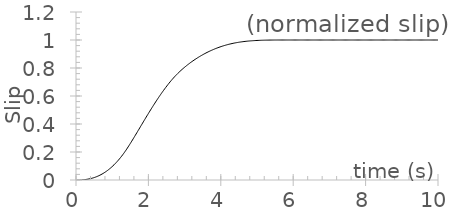
| Category | displacement |
|---|---|
| 0.0 | 0 |
| 0.01 | 0 |
| 0.02 | 0 |
| 0.03 | 0 |
| 0.04 | 0 |
| 0.05 | 0 |
| 0.06 | 0 |
| 0.07 | 0 |
| 0.08 | 0 |
| 0.09 | 0 |
| 0.1 | 0 |
| 0.11 | 0 |
| 0.12 | 0 |
| 0.13 | 0.001 |
| 0.14 | 0.001 |
| 0.15 | 0.001 |
| 0.16 | 0.001 |
| 0.17 | 0.001 |
| 0.18 | 0.001 |
| 0.19 | 0.002 |
| 0.2 | 0.002 |
| 0.21 | 0.002 |
| 0.22 | 0.002 |
| 0.23 | 0.002 |
| 0.24 | 0.003 |
| 0.25 | 0.003 |
| 0.26 | 0.003 |
| 0.27 | 0.004 |
| 0.28 | 0.004 |
| 0.29 | 0.004 |
| 0.3 | 0.005 |
| 0.31 | 0.005 |
| 0.32 | 0.006 |
| 0.33 | 0.006 |
| 0.34 | 0.007 |
| 0.35 | 0.007 |
| 0.36 | 0.008 |
| 0.37 | 0.008 |
| 0.38 | 0.009 |
| 0.39 | 0.009 |
| 0.4 | 0.01 |
| 0.41 | 0.01 |
| 0.42 | 0.011 |
| 0.43 | 0.012 |
| 0.44 | 0.013 |
| 0.45 | 0.013 |
| 0.46 | 0.014 |
| 0.47 | 0.015 |
| 0.48 | 0.016 |
| 0.49 | 0.016 |
| 0.5 | 0.017 |
| 0.51 | 0.018 |
| 0.52 | 0.019 |
| 0.53 | 0.02 |
| 0.54 | 0.021 |
| 0.55 | 0.022 |
| 0.56 | 0.023 |
| 0.57 | 0.024 |
| 0.58 | 0.025 |
| 0.59 | 0.026 |
| 0.6 | 0.027 |
| 0.61 | 0.028 |
| 0.62 | 0.029 |
| 0.63 | 0.031 |
| 0.64 | 0.032 |
| 0.65 | 0.033 |
| 0.66 | 0.034 |
| 0.67 | 0.036 |
| 0.68 | 0.037 |
| 0.69 | 0.038 |
| 0.7 | 0.04 |
| 0.71 | 0.041 |
| 0.72 | 0.043 |
| 0.73 | 0.044 |
| 0.74 | 0.046 |
| 0.75 | 0.047 |
| 0.76 | 0.049 |
| 0.77 | 0.05 |
| 0.78 | 0.052 |
| 0.79 | 0.054 |
| 0.8 | 0.055 |
| 0.81 | 0.057 |
| 0.82 | 0.059 |
| 0.83 | 0.061 |
| 0.84 | 0.062 |
| 0.85 | 0.064 |
| 0.86 | 0.066 |
| 0.87 | 0.068 |
| 0.88 | 0.07 |
| 0.89 | 0.072 |
| 0.9 | 0.074 |
| 0.91 | 0.076 |
| 0.92 | 0.078 |
| 0.93 | 0.08 |
| 0.94 | 0.082 |
| 0.95 | 0.085 |
| 0.96 | 0.087 |
| 0.97 | 0.089 |
| 0.98 | 0.091 |
| 0.99 | 0.094 |
| 1.0 | 0.096 |
| 1.01 | 0.098 |
| 1.02 | 0.101 |
| 1.03 | 0.103 |
| 1.04 | 0.106 |
| 1.05 | 0.108 |
| 1.06 | 0.111 |
| 1.07 | 0.114 |
| 1.08 | 0.116 |
| 1.09 | 0.119 |
| 1.1 | 0.122 |
| 1.11 | 0.124 |
| 1.12 | 0.127 |
| 1.13 | 0.13 |
| 1.14 | 0.133 |
| 1.15 | 0.136 |
| 1.16 | 0.139 |
| 1.17 | 0.142 |
| 1.18 | 0.145 |
| 1.19 | 0.148 |
| 1.2 | 0.151 |
| 1.21 | 0.154 |
| 1.22 | 0.157 |
| 1.23 | 0.16 |
| 1.24 | 0.163 |
| 1.25 | 0.167 |
| 1.26 | 0.17 |
| 1.27 | 0.173 |
| 1.28 | 0.177 |
| 1.29 | 0.18 |
| 1.3 | 0.184 |
| 1.31 | 0.187 |
| 1.32 | 0.191 |
| 1.33 | 0.194 |
| 1.34 | 0.198 |
| 1.35 | 0.202 |
| 1.36 | 0.205 |
| 1.37 | 0.209 |
| 1.38 | 0.213 |
| 1.39 | 0.217 |
| 1.4 | 0.221 |
| 1.41 | 0.224 |
| 1.42 | 0.228 |
| 1.43 | 0.232 |
| 1.44 | 0.236 |
| 1.45 | 0.24 |
| 1.46 | 0.244 |
| 1.47 | 0.248 |
| 1.48 | 0.252 |
| 1.49 | 0.257 |
| 1.5 | 0.261 |
| 1.51 | 0.265 |
| 1.52 | 0.269 |
| 1.53 | 0.273 |
| 1.54 | 0.277 |
| 1.55 | 0.282 |
| 1.56 | 0.286 |
| 1.57 | 0.29 |
| 1.58 | 0.294 |
| 1.59 | 0.299 |
| 1.6 | 0.303 |
| 1.61 | 0.307 |
| 1.62 | 0.311 |
| 1.63 | 0.316 |
| 1.64 | 0.32 |
| 1.65 | 0.324 |
| 1.66 | 0.329 |
| 1.67 | 0.333 |
| 1.68 | 0.337 |
| 1.69 | 0.341 |
| 1.7 | 0.346 |
| 1.71 | 0.35 |
| 1.72 | 0.354 |
| 1.73 | 0.359 |
| 1.74 | 0.363 |
| 1.75 | 0.368 |
| 1.76 | 0.372 |
| 1.77 | 0.376 |
| 1.78 | 0.381 |
| 1.79 | 0.385 |
| 1.8 | 0.389 |
| 1.81 | 0.394 |
| 1.82 | 0.398 |
| 1.83 | 0.402 |
| 1.84 | 0.407 |
| 1.85 | 0.411 |
| 1.86 | 0.415 |
| 1.87 | 0.42 |
| 1.88 | 0.424 |
| 1.89 | 0.428 |
| 1.9 | 0.432 |
| 1.91 | 0.437 |
| 1.92 | 0.441 |
| 1.93 | 0.445 |
| 1.94 | 0.45 |
| 1.95 | 0.454 |
| 1.96 | 0.458 |
| 1.97 | 0.462 |
| 1.98 | 0.467 |
| 1.99 | 0.471 |
| 2.0 | 0.475 |
| 2.01 | 0.479 |
| 2.02 | 0.484 |
| 2.03 | 0.488 |
| 2.04 | 0.492 |
| 2.05 | 0.496 |
| 2.06 | 0.5 |
| 2.07 | 0.505 |
| 2.08 | 0.509 |
| 2.09 | 0.513 |
| 2.1 | 0.517 |
| 2.11 | 0.521 |
| 2.12 | 0.525 |
| 2.13 | 0.529 |
| 2.14 | 0.533 |
| 2.15 | 0.537 |
| 2.16 | 0.541 |
| 2.17 | 0.545 |
| 2.18 | 0.549 |
| 2.19 | 0.553 |
| 2.2 | 0.557 |
| 2.21 | 0.561 |
| 2.22 | 0.565 |
| 2.23 | 0.569 |
| 2.24 | 0.573 |
| 2.25 | 0.577 |
| 2.26 | 0.581 |
| 2.27 | 0.585 |
| 2.28 | 0.589 |
| 2.29 | 0.593 |
| 2.3 | 0.596 |
| 2.31 | 0.6 |
| 2.32 | 0.604 |
| 2.33 | 0.608 |
| 2.34 | 0.611 |
| 2.35 | 0.615 |
| 2.36 | 0.619 |
| 2.37 | 0.622 |
| 2.38 | 0.626 |
| 2.39 | 0.63 |
| 2.4 | 0.633 |
| 2.41 | 0.637 |
| 2.42 | 0.641 |
| 2.43 | 0.644 |
| 2.44 | 0.648 |
| 2.45 | 0.651 |
| 2.46 | 0.655 |
| 2.47 | 0.658 |
| 2.48 | 0.662 |
| 2.49 | 0.665 |
| 2.5 | 0.668 |
| 2.51 | 0.672 |
| 2.52 | 0.675 |
| 2.53 | 0.678 |
| 2.54 | 0.682 |
| 2.55 | 0.685 |
| 2.56 | 0.688 |
| 2.57 | 0.691 |
| 2.58 | 0.695 |
| 2.59 | 0.698 |
| 2.6 | 0.701 |
| 2.61 | 0.704 |
| 2.62 | 0.707 |
| 2.63 | 0.71 |
| 2.64 | 0.713 |
| 2.65 | 0.716 |
| 2.66 | 0.719 |
| 2.67 | 0.722 |
| 2.68 | 0.725 |
| 2.69 | 0.728 |
| 2.7 | 0.731 |
| 2.71 | 0.734 |
| 2.72 | 0.737 |
| 2.73 | 0.739 |
| 2.74 | 0.742 |
| 2.75 | 0.745 |
| 2.76 | 0.748 |
| 2.77 | 0.75 |
| 2.78 | 0.753 |
| 2.79 | 0.756 |
| 2.8 | 0.758 |
| 2.81 | 0.761 |
| 2.82 | 0.763 |
| 2.83 | 0.766 |
| 2.84 | 0.768 |
| 2.85 | 0.771 |
| 2.86 | 0.773 |
| 2.87 | 0.776 |
| 2.88 | 0.778 |
| 2.89 | 0.78 |
| 2.9 | 0.783 |
| 2.91 | 0.785 |
| 2.92 | 0.787 |
| 2.93 | 0.79 |
| 2.94 | 0.792 |
| 2.95 | 0.794 |
| 2.96 | 0.797 |
| 2.97 | 0.799 |
| 2.98 | 0.801 |
| 2.99 | 0.803 |
| 3.0 | 0.805 |
| 3.01 | 0.807 |
| 3.02 | 0.81 |
| 3.03 | 0.812 |
| 3.04 | 0.814 |
| 3.05 | 0.816 |
| 3.06 | 0.818 |
| 3.07 | 0.82 |
| 3.08 | 0.822 |
| 3.09 | 0.824 |
| 3.1 | 0.826 |
| 3.11 | 0.828 |
| 3.12 | 0.83 |
| 3.13 | 0.832 |
| 3.14 | 0.834 |
| 3.15 | 0.836 |
| 3.16 | 0.838 |
| 3.17 | 0.84 |
| 3.18 | 0.842 |
| 3.19 | 0.843 |
| 3.2 | 0.845 |
| 3.21 | 0.847 |
| 3.22 | 0.849 |
| 3.23 | 0.851 |
| 3.24 | 0.853 |
| 3.25 | 0.854 |
| 3.26 | 0.856 |
| 3.27 | 0.858 |
| 3.28 | 0.86 |
| 3.29 | 0.861 |
| 3.3 | 0.863 |
| 3.31 | 0.865 |
| 3.32 | 0.867 |
| 3.33 | 0.868 |
| 3.34 | 0.87 |
| 3.35 | 0.871 |
| 3.36 | 0.873 |
| 3.37 | 0.875 |
| 3.38 | 0.876 |
| 3.39 | 0.878 |
| 3.4 | 0.88 |
| 3.41 | 0.881 |
| 3.42 | 0.883 |
| 3.43 | 0.884 |
| 3.44 | 0.886 |
| 3.45 | 0.887 |
| 3.46 | 0.889 |
| 3.47 | 0.89 |
| 3.48 | 0.892 |
| 3.49 | 0.893 |
| 3.5 | 0.895 |
| 3.51 | 0.896 |
| 3.52 | 0.898 |
| 3.53 | 0.899 |
| 3.54 | 0.9 |
| 3.55 | 0.902 |
| 3.56 | 0.903 |
| 3.57 | 0.904 |
| 3.58 | 0.906 |
| 3.59 | 0.907 |
| 3.6 | 0.908 |
| 3.61 | 0.91 |
| 3.62 | 0.911 |
| 3.63 | 0.912 |
| 3.64 | 0.914 |
| 3.65 | 0.915 |
| 3.66 | 0.916 |
| 3.67 | 0.917 |
| 3.68 | 0.919 |
| 3.69 | 0.92 |
| 3.7 | 0.921 |
| 3.71 | 0.922 |
| 3.72 | 0.924 |
| 3.73 | 0.925 |
| 3.74 | 0.926 |
| 3.75 | 0.927 |
| 3.76 | 0.928 |
| 3.77 | 0.929 |
| 3.78 | 0.93 |
| 3.79 | 0.932 |
| 3.8 | 0.933 |
| 3.81 | 0.934 |
| 3.82 | 0.935 |
| 3.83 | 0.936 |
| 3.84 | 0.937 |
| 3.85 | 0.938 |
| 3.86 | 0.939 |
| 3.87 | 0.94 |
| 3.88 | 0.941 |
| 3.89 | 0.942 |
| 3.9 | 0.943 |
| 3.91 | 0.944 |
| 3.92 | 0.945 |
| 3.93 | 0.946 |
| 3.94 | 0.947 |
| 3.95 | 0.948 |
| 3.96 | 0.949 |
| 3.97 | 0.95 |
| 3.98 | 0.951 |
| 3.99 | 0.951 |
| 4.0 | 0.952 |
| 4.01 | 0.953 |
| 4.02 | 0.954 |
| 4.03 | 0.955 |
| 4.04 | 0.956 |
| 4.05 | 0.957 |
| 4.06 | 0.957 |
| 4.07 | 0.958 |
| 4.08 | 0.959 |
| 4.09 | 0.96 |
| 4.1 | 0.961 |
| 4.11 | 0.961 |
| 4.12 | 0.962 |
| 4.13 | 0.963 |
| 4.14 | 0.964 |
| 4.15 | 0.964 |
| 4.16 | 0.965 |
| 4.17 | 0.966 |
| 4.18 | 0.966 |
| 4.19 | 0.967 |
| 4.2 | 0.968 |
| 4.21 | 0.968 |
| 4.22 | 0.969 |
| 4.23 | 0.97 |
| 4.24 | 0.97 |
| 4.25 | 0.971 |
| 4.26 | 0.972 |
| 4.27 | 0.972 |
| 4.28 | 0.973 |
| 4.29 | 0.973 |
| 4.3 | 0.974 |
| 4.31 | 0.975 |
| 4.32 | 0.975 |
| 4.33 | 0.976 |
| 4.34 | 0.976 |
| 4.35 | 0.977 |
| 4.36 | 0.977 |
| 4.37 | 0.978 |
| 4.38 | 0.978 |
| 4.39 | 0.979 |
| 4.4 | 0.979 |
| 4.41 | 0.98 |
| 4.42 | 0.98 |
| 4.43 | 0.981 |
| 4.44 | 0.981 |
| 4.45 | 0.982 |
| 4.46 | 0.982 |
| 4.47 | 0.983 |
| 4.48 | 0.983 |
| 4.49 | 0.984 |
| 4.5 | 0.984 |
| 4.51 | 0.984 |
| 4.52 | 0.985 |
| 4.53 | 0.985 |
| 4.54 | 0.986 |
| 4.55 | 0.986 |
| 4.56 | 0.986 |
| 4.57 | 0.987 |
| 4.58 | 0.987 |
| 4.59 | 0.987 |
| 4.6 | 0.988 |
| 4.61 | 0.988 |
| 4.62 | 0.988 |
| 4.63 | 0.989 |
| 4.64 | 0.989 |
| 4.65 | 0.989 |
| 4.66 | 0.99 |
| 4.67 | 0.99 |
| 4.68 | 0.99 |
| 4.69 | 0.99 |
| 4.7 | 0.991 |
| 4.71 | 0.991 |
| 4.72 | 0.991 |
| 4.73 | 0.992 |
| 4.74 | 0.992 |
| 4.75 | 0.992 |
| 4.76 | 0.992 |
| 4.77 | 0.993 |
| 4.78 | 0.993 |
| 4.79 | 0.993 |
| 4.8 | 0.993 |
| 4.81 | 0.993 |
| 4.82 | 0.994 |
| 4.83 | 0.994 |
| 4.84 | 0.994 |
| 4.85 | 0.994 |
| 4.86 | 0.994 |
| 4.87 | 0.995 |
| 4.88 | 0.995 |
| 4.89 | 0.995 |
| 4.9 | 0.995 |
| 4.91 | 0.995 |
| 4.92 | 0.996 |
| 4.93 | 0.996 |
| 4.94 | 0.996 |
| 4.95 | 0.996 |
| 4.96 | 0.996 |
| 4.97 | 0.996 |
| 4.98 | 0.996 |
| 4.99 | 0.997 |
| 5.0 | 0.997 |
| 5.01 | 0.997 |
| 5.02 | 0.997 |
| 5.03 | 0.997 |
| 5.04 | 0.997 |
| 5.05 | 0.997 |
| 5.06 | 0.997 |
| 5.07 | 0.998 |
| 5.08 | 0.998 |
| 5.09 | 0.998 |
| 5.1 | 0.998 |
| 5.11 | 0.998 |
| 5.12 | 0.998 |
| 5.13 | 0.998 |
| 5.14 | 0.998 |
| 5.15 | 0.998 |
| 5.16 | 0.998 |
| 5.17 | 0.998 |
| 5.18 | 0.999 |
| 5.19 | 0.999 |
| 5.2 | 0.999 |
| 5.21 | 0.999 |
| 5.22 | 0.999 |
| 5.23 | 0.999 |
| 5.24 | 0.999 |
| 5.25 | 0.999 |
| 5.26 | 0.999 |
| 5.27 | 0.999 |
| 5.28 | 0.999 |
| 5.29 | 0.999 |
| 5.3 | 0.999 |
| 5.31 | 0.999 |
| 5.32 | 0.999 |
| 5.33 | 0.999 |
| 5.34 | 0.999 |
| 5.35 | 0.999 |
| 5.36 | 0.999 |
| 5.37 | 0.999 |
| 5.38 | 1 |
| 5.39 | 1 |
| 5.4 | 1 |
| 5.41 | 1 |
| 5.42 | 1 |
| 5.43 | 1 |
| 5.44 | 1 |
| 5.45 | 1 |
| 5.46 | 1 |
| 5.47 | 1 |
| 5.48 | 1 |
| 5.49 | 1 |
| 5.5 | 1 |
| 5.51 | 1 |
| 5.52 | 1 |
| 5.53 | 1 |
| 5.54 | 1 |
| 5.55 | 1 |
| 5.56 | 1 |
| 5.57 | 1 |
| 5.58 | 1 |
| 5.59 | 1 |
| 5.6 | 1 |
| 5.61 | 1 |
| 5.62 | 1 |
| 5.63 | 1 |
| 5.64 | 1 |
| 5.65 | 1 |
| 5.66 | 1 |
| 5.67 | 1 |
| 5.68 | 1 |
| 5.69 | 1 |
| 5.7 | 1 |
| 5.71 | 1 |
| 5.72 | 1 |
| 5.73 | 1 |
| 5.74 | 1 |
| 5.75 | 1 |
| 5.76 | 1 |
| 5.77 | 1 |
| 5.78 | 1 |
| 5.79 | 1 |
| 5.8 | 1 |
| 5.81 | 1 |
| 5.82 | 1 |
| 5.83 | 1 |
| 5.84 | 1 |
| 5.85 | 1 |
| 5.86 | 1 |
| 5.87 | 1 |
| 5.88 | 1 |
| 5.89 | 1 |
| 5.9 | 1 |
| 5.91 | 1 |
| 5.92 | 1 |
| 5.93 | 1 |
| 5.94 | 1 |
| 5.95 | 1 |
| 5.96 | 1 |
| 5.97 | 1 |
| 5.98 | 1 |
| 5.99 | 1 |
| 6.0 | 1 |
| 6.01 | 1 |
| 6.02 | 1 |
| 6.03 | 1 |
| 6.04 | 1 |
| 6.05 | 1 |
| 6.06 | 1 |
| 6.07 | 1 |
| 6.08 | 1 |
| 6.09 | 1 |
| 6.1 | 1 |
| 6.11 | 1 |
| 6.12 | 1 |
| 6.13 | 1 |
| 6.14 | 1 |
| 6.15 | 1 |
| 6.16 | 1 |
| 6.17 | 1 |
| 6.18 | 1 |
| 6.19 | 1 |
| 6.2 | 1 |
| 6.21 | 1 |
| 6.22 | 1 |
| 6.23 | 1 |
| 6.24 | 1 |
| 6.25 | 1 |
| 6.26 | 1 |
| 6.27 | 1 |
| 6.28 | 1 |
| 6.29 | 1 |
| 6.3 | 1 |
| 6.31 | 1 |
| 6.32 | 1 |
| 6.33 | 1 |
| 6.34 | 1 |
| 6.35 | 1 |
| 6.36 | 1 |
| 6.37 | 1 |
| 6.38 | 1 |
| 6.39 | 1 |
| 6.4 | 1 |
| 6.41 | 1 |
| 6.42 | 1 |
| 6.43 | 1 |
| 6.44 | 1 |
| 6.45 | 1 |
| 6.46 | 1 |
| 6.47 | 1 |
| 6.48 | 1 |
| 6.49 | 1 |
| 6.5 | 1 |
| 6.51 | 1 |
| 6.52 | 1 |
| 6.53 | 1 |
| 6.54 | 1 |
| 6.55 | 1 |
| 6.56 | 1 |
| 6.57 | 1 |
| 6.58 | 1 |
| 6.59 | 1 |
| 6.6 | 1 |
| 6.61 | 1 |
| 6.62 | 1 |
| 6.63 | 1 |
| 6.64 | 1 |
| 6.65 | 1 |
| 6.66 | 1 |
| 6.67 | 1 |
| 6.68 | 1 |
| 6.69 | 1 |
| 6.7 | 1 |
| 6.71 | 1 |
| 6.72 | 1 |
| 6.73 | 1 |
| 6.74 | 1 |
| 6.75 | 1 |
| 6.76 | 1 |
| 6.77 | 1 |
| 6.78 | 1 |
| 6.79 | 1 |
| 6.8 | 1 |
| 6.81 | 1 |
| 6.82 | 1 |
| 6.83 | 1 |
| 6.84 | 1 |
| 6.85 | 1 |
| 6.86 | 1 |
| 6.87 | 1 |
| 6.88 | 1 |
| 6.89 | 1 |
| 6.9 | 1 |
| 6.91 | 1 |
| 6.92 | 1 |
| 6.93 | 1 |
| 6.94 | 1 |
| 6.95 | 1 |
| 6.96 | 1 |
| 6.97 | 1 |
| 6.98 | 1 |
| 6.99 | 1 |
| 7.0 | 1 |
| 7.01 | 1 |
| 7.02 | 1 |
| 7.03 | 1 |
| 7.04 | 1 |
| 7.05 | 1 |
| 7.06 | 1 |
| 7.07 | 1 |
| 7.08 | 1 |
| 7.09 | 1 |
| 7.1 | 1 |
| 7.11 | 1 |
| 7.12 | 1 |
| 7.13 | 1 |
| 7.14 | 1 |
| 7.15 | 1 |
| 7.16 | 1 |
| 7.17 | 1 |
| 7.18 | 1 |
| 7.19 | 1 |
| 7.2 | 1 |
| 7.21 | 1 |
| 7.22 | 1 |
| 7.23 | 1 |
| 7.24 | 1 |
| 7.25 | 1 |
| 7.26 | 1 |
| 7.27 | 1 |
| 7.28 | 1 |
| 7.29 | 1 |
| 7.3 | 1 |
| 7.31 | 1 |
| 7.32 | 1 |
| 7.33 | 1 |
| 7.34 | 1 |
| 7.35 | 1 |
| 7.36 | 1 |
| 7.37 | 1 |
| 7.38 | 1 |
| 7.39 | 1 |
| 7.4 | 1 |
| 7.41 | 1 |
| 7.42 | 1 |
| 7.43 | 1 |
| 7.44 | 1 |
| 7.45 | 1 |
| 7.46 | 1 |
| 7.47 | 1 |
| 7.48 | 1 |
| 7.49 | 1 |
| 7.5 | 1 |
| 7.51 | 1 |
| 7.52 | 1 |
| 7.53 | 1 |
| 7.54 | 1 |
| 7.55 | 1 |
| 7.56 | 1 |
| 7.57 | 1 |
| 7.58 | 1 |
| 7.59 | 1 |
| 7.6 | 1 |
| 7.61 | 1 |
| 7.62 | 1 |
| 7.63 | 1 |
| 7.64 | 1 |
| 7.65 | 1 |
| 7.66 | 1 |
| 7.67 | 1 |
| 7.68 | 1 |
| 7.69 | 1 |
| 7.7 | 1 |
| 7.71 | 1 |
| 7.72 | 1 |
| 7.73 | 1 |
| 7.74 | 1 |
| 7.75 | 1 |
| 7.76 | 1 |
| 7.77 | 1 |
| 7.78 | 1 |
| 7.79 | 1 |
| 7.8 | 1 |
| 7.81 | 1 |
| 7.82 | 1 |
| 7.83 | 1 |
| 7.84 | 1 |
| 7.85 | 1 |
| 7.86 | 1 |
| 7.87 | 1 |
| 7.88 | 1 |
| 7.89 | 1 |
| 7.9 | 1 |
| 7.91 | 1 |
| 7.92 | 1 |
| 7.93 | 1 |
| 7.94 | 1 |
| 7.95 | 1 |
| 7.96 | 1 |
| 7.97 | 1 |
| 7.98 | 1 |
| 7.99 | 1 |
| 8.0 | 1 |
| 8.01 | 1 |
| 8.02 | 1 |
| 8.03 | 1 |
| 8.04 | 1 |
| 8.05 | 1 |
| 8.06 | 1 |
| 8.07 | 1 |
| 8.08 | 1 |
| 8.09 | 1 |
| 8.1 | 1 |
| 8.11 | 1 |
| 8.12 | 1 |
| 8.13 | 1 |
| 8.14 | 1 |
| 8.15 | 1 |
| 8.16 | 1 |
| 8.17 | 1 |
| 8.18 | 1 |
| 8.19 | 1 |
| 8.2 | 1 |
| 8.21 | 1 |
| 8.22 | 1 |
| 8.23 | 1 |
| 8.24 | 1 |
| 8.25 | 1 |
| 8.26 | 1 |
| 8.27 | 1 |
| 8.28 | 1 |
| 8.29 | 1 |
| 8.3 | 1 |
| 8.31 | 1 |
| 8.32 | 1 |
| 8.33 | 1 |
| 8.34 | 1 |
| 8.35 | 1 |
| 8.36 | 1 |
| 8.37 | 1 |
| 8.38 | 1 |
| 8.39 | 1 |
| 8.4 | 1 |
| 8.41 | 1 |
| 8.42 | 1 |
| 8.43 | 1 |
| 8.44 | 1 |
| 8.45 | 1 |
| 8.46 | 1 |
| 8.47 | 1 |
| 8.48 | 1 |
| 8.49 | 1 |
| 8.5 | 1 |
| 8.51 | 1 |
| 8.52 | 1 |
| 8.53 | 1 |
| 8.54 | 1 |
| 8.55 | 1 |
| 8.56 | 1 |
| 8.57 | 1 |
| 8.58 | 1 |
| 8.59 | 1 |
| 8.6 | 1 |
| 8.61 | 1 |
| 8.62 | 1 |
| 8.63 | 1 |
| 8.64 | 1 |
| 8.65 | 1 |
| 8.66 | 1 |
| 8.67 | 1 |
| 8.68 | 1 |
| 8.69 | 1 |
| 8.7 | 1 |
| 8.71 | 1 |
| 8.72 | 1 |
| 8.73 | 1 |
| 8.74 | 1 |
| 8.75 | 1 |
| 8.76 | 1 |
| 8.77 | 1 |
| 8.78 | 1 |
| 8.79 | 1 |
| 8.8 | 1 |
| 8.81 | 1 |
| 8.82 | 1 |
| 8.83 | 1 |
| 8.84 | 1 |
| 8.85 | 1 |
| 8.86 | 1 |
| 8.87 | 1 |
| 8.88 | 1 |
| 8.89 | 1 |
| 8.9 | 1 |
| 8.91 | 1 |
| 8.92 | 1 |
| 8.93 | 1 |
| 8.94 | 1 |
| 8.95 | 1 |
| 8.96 | 1 |
| 8.97 | 1 |
| 8.98 | 1 |
| 8.99 | 1 |
| 9.0 | 1 |
| 9.01 | 1 |
| 9.02 | 1 |
| 9.03 | 1 |
| 9.04 | 1 |
| 9.05 | 1 |
| 9.06 | 1 |
| 9.07 | 1 |
| 9.08 | 1 |
| 9.09 | 1 |
| 9.1 | 1 |
| 9.11 | 1 |
| 9.12 | 1 |
| 9.13 | 1 |
| 9.14 | 1 |
| 9.15 | 1 |
| 9.16 | 1 |
| 9.17 | 1 |
| 9.18 | 1 |
| 9.19 | 1 |
| 9.2 | 1 |
| 9.21 | 1 |
| 9.22 | 1 |
| 9.23 | 1 |
| 9.24 | 1 |
| 9.25 | 1 |
| 9.26 | 1 |
| 9.27 | 1 |
| 9.28 | 1 |
| 9.29 | 1 |
| 9.3 | 1 |
| 9.31 | 1 |
| 9.32 | 1 |
| 9.33 | 1 |
| 9.34 | 1 |
| 9.35 | 1 |
| 9.36 | 1 |
| 9.37 | 1 |
| 9.38 | 1 |
| 9.39 | 1 |
| 9.4 | 1 |
| 9.41 | 1 |
| 9.42 | 1 |
| 9.43 | 1 |
| 9.44 | 1 |
| 9.45 | 1 |
| 9.46 | 1 |
| 9.47 | 1 |
| 9.48 | 1 |
| 9.49 | 1 |
| 9.5 | 1 |
| 9.51 | 1 |
| 9.52 | 1 |
| 9.53 | 1 |
| 9.54 | 1 |
| 9.55 | 1 |
| 9.56 | 1 |
| 9.57 | 1 |
| 9.58 | 1 |
| 9.59 | 1 |
| 9.6 | 1 |
| 9.61 | 1 |
| 9.62 | 1 |
| 9.63 | 1 |
| 9.64 | 1 |
| 9.65 | 1 |
| 9.66 | 1 |
| 9.67 | 1 |
| 9.68 | 1 |
| 9.69 | 1 |
| 9.7 | 1 |
| 9.71 | 1 |
| 9.72 | 1 |
| 9.73 | 1 |
| 9.74 | 1 |
| 9.75 | 1 |
| 9.76 | 1 |
| 9.77 | 1 |
| 9.78 | 1 |
| 9.79 | 1 |
| 9.8 | 1 |
| 9.81 | 1 |
| 9.82 | 1 |
| 9.83 | 1 |
| 9.84 | 1 |
| 9.85 | 1 |
| 9.86 | 1 |
| 9.87 | 1 |
| 9.88 | 1 |
| 9.89 | 1 |
| 9.9 | 1 |
| 9.91 | 1 |
| 9.92 | 1 |
| 9.93 | 1 |
| 9.94 | 1 |
| 9.95 | 1 |
| 9.96 | 1 |
| 9.97 | 1 |
| 9.98 | 1 |
| 9.99 | 1 |
| 10.0 | 1 |
| 10.01 | 1 |
| 10.02 | 1 |
| 10.03 | 1 |
| 10.04 | 1 |
| 10.05 | 1 |
| 10.06 | 1 |
| 10.07 | 1 |
| 10.08 | 1 |
| 10.09 | 1 |
| 10.1 | 1 |
| 10.11 | 1 |
| 10.12 | 1 |
| 10.13 | 1 |
| 10.14 | 1 |
| 10.15 | 1 |
| 10.16 | 1 |
| 10.17 | 1 |
| 10.18 | 1 |
| 10.19 | 1 |
| 10.2 | 1 |
| 10.21 | 1 |
| 10.22 | 1 |
| 10.23 | 1 |
| 10.24 | 1 |
| 10.25 | 1 |
| 10.26 | 1 |
| 10.27 | 1 |
| 10.28 | 1 |
| 10.29 | 1 |
| 10.3 | 1 |
| 10.31 | 1 |
| 10.32 | 1 |
| 10.33 | 1 |
| 10.34 | 1 |
| 10.35 | 1 |
| 10.36 | 1 |
| 10.37 | 1 |
| 10.38 | 1 |
| 10.39 | 1 |
| 10.4 | 1 |
| 10.41 | 1 |
| 10.42 | 1 |
| 10.43 | 1 |
| 10.44 | 1 |
| 10.45 | 1 |
| 10.46 | 1 |
| 10.47 | 1 |
| 10.48 | 1 |
| 10.49 | 1 |
| 10.5 | 1 |
| 10.51 | 1 |
| 10.52 | 1 |
| 10.53 | 1 |
| 10.54 | 1 |
| 10.55 | 1 |
| 10.56 | 1 |
| 10.57 | 1 |
| 10.58 | 1 |
| 10.59 | 1 |
| 10.6 | 1 |
| 10.61 | 1 |
| 10.62 | 1 |
| 10.63 | 1 |
| 10.64 | 1 |
| 10.65 | 1 |
| 10.66 | 1 |
| 10.67 | 1 |
| 10.68 | 1 |
| 10.69 | 1 |
| 10.7 | 1 |
| 10.71 | 1 |
| 10.72 | 1 |
| 10.73 | 1 |
| 10.74 | 1 |
| 10.75 | 1 |
| 10.76 | 1 |
| 10.77 | 1 |
| 10.78 | 1 |
| 10.79 | 1 |
| 10.8 | 1 |
| 10.81 | 1 |
| 10.82 | 1 |
| 10.83 | 1 |
| 10.84 | 1 |
| 10.85 | 1 |
| 10.86 | 1 |
| 10.87 | 1 |
| 10.88 | 1 |
| 10.89 | 1 |
| 10.9 | 1 |
| 10.91 | 1 |
| 10.92 | 1 |
| 10.93 | 1 |
| 10.94 | 1 |
| 10.95 | 1 |
| 10.96 | 1 |
| 10.97 | 1 |
| 10.98 | 1 |
| 10.99 | 1 |
| 11.0 | 1 |
| 11.01 | 1 |
| 11.02 | 1 |
| 11.03 | 1 |
| 11.04 | 1 |
| 11.05 | 1 |
| 11.06 | 1 |
| 11.07 | 1 |
| 11.08 | 1 |
| 11.09 | 1 |
| 11.1 | 1 |
| 11.11 | 1 |
| 11.12 | 1 |
| 11.13 | 1 |
| 11.14 | 1 |
| 11.15 | 1 |
| 11.16 | 1 |
| 11.17 | 1 |
| 11.18 | 1 |
| 11.19 | 1 |
| 11.2 | 1 |
| 11.21 | 1 |
| 11.22 | 1 |
| 11.23 | 1 |
| 11.24 | 1 |
| 11.25 | 1 |
| 11.26 | 1 |
| 11.27 | 1 |
| 11.28 | 1 |
| 11.29 | 1 |
| 11.3 | 1 |
| 11.31 | 1 |
| 11.32 | 1 |
| 11.33 | 1 |
| 11.34 | 1 |
| 11.35 | 1 |
| 11.36 | 1 |
| 11.37 | 1 |
| 11.38 | 1 |
| 11.39 | 1 |
| 11.4 | 1 |
| 11.41 | 1 |
| 11.42 | 1 |
| 11.43 | 1 |
| 11.44 | 1 |
| 11.45 | 1 |
| 11.46 | 1 |
| 11.47 | 1 |
| 11.48 | 1 |
| 11.49 | 1 |
| 11.5 | 1 |
| 11.51 | 1 |
| 11.52 | 1 |
| 11.53 | 1 |
| 11.54 | 1 |
| 11.55 | 1 |
| 11.56 | 1 |
| 11.57 | 1 |
| 11.58 | 1 |
| 11.59 | 1 |
| 11.6 | 1 |
| 11.61 | 1 |
| 11.62 | 1 |
| 11.63 | 1 |
| 11.64 | 1 |
| 11.65 | 1 |
| 11.66 | 1 |
| 11.67 | 1 |
| 11.68 | 1 |
| 11.69 | 1 |
| 11.7 | 1 |
| 11.71 | 1 |
| 11.72 | 1 |
| 11.73 | 1 |
| 11.74 | 1 |
| 11.75 | 1 |
| 11.76 | 1 |
| 11.77 | 1 |
| 11.78 | 1 |
| 11.79 | 1 |
| 11.8 | 1 |
| 11.81 | 1 |
| 11.82 | 1 |
| 11.83 | 1 |
| 11.84 | 1 |
| 11.85 | 1 |
| 11.86 | 1 |
| 11.87 | 1 |
| 11.88 | 1 |
| 11.89 | 1 |
| 11.9 | 1 |
| 11.91 | 1 |
| 11.92 | 1 |
| 11.93 | 1 |
| 11.94 | 1 |
| 11.95 | 1 |
| 11.96 | 1 |
| 11.97 | 1 |
| 11.98 | 1 |
| 11.99 | 1 |
| 12.0 | 1 |
| 12.01 | 1 |
| 12.02 | 1 |
| 12.03 | 1 |
| 12.04 | 1 |
| 12.05 | 1 |
| 12.06 | 1 |
| 12.07 | 1 |
| 12.08 | 1 |
| 12.09 | 1 |
| 12.1 | 1 |
| 12.11 | 1 |
| 12.12 | 1 |
| 12.13 | 1 |
| 12.14 | 1 |
| 12.15 | 1 |
| 12.16 | 1 |
| 12.17 | 1 |
| 12.18 | 1 |
| 12.19 | 1 |
| 12.2 | 1 |
| 12.21 | 1 |
| 12.22 | 1 |
| 12.23 | 1 |
| 12.24 | 1 |
| 12.25 | 1 |
| 12.26 | 1 |
| 12.27 | 1 |
| 12.28 | 1 |
| 12.29 | 1 |
| 12.3 | 1 |
| 12.31 | 1 |
| 12.32 | 1 |
| 12.33 | 1 |
| 12.34 | 1 |
| 12.35 | 1 |
| 12.36 | 1 |
| 12.37 | 1 |
| 12.38 | 1 |
| 12.39 | 1 |
| 12.4 | 1 |
| 12.41 | 1 |
| 12.42 | 1 |
| 12.43 | 1 |
| 12.44 | 1 |
| 12.45 | 1 |
| 12.46 | 1 |
| 12.47 | 1 |
| 12.48 | 1 |
| 12.49 | 1 |
| 12.5 | 1 |
| 12.51 | 1 |
| 12.52 | 1 |
| 12.53 | 1 |
| 12.54 | 1 |
| 12.55 | 1 |
| 12.56 | 1 |
| 12.57 | 1 |
| 12.58 | 1 |
| 12.59 | 1 |
| 12.6 | 1 |
| 12.61 | 1 |
| 12.62 | 1 |
| 12.63 | 1 |
| 12.64 | 1 |
| 12.65 | 1 |
| 12.66 | 1 |
| 12.67 | 1 |
| 12.68 | 1 |
| 12.69 | 1 |
| 12.7 | 1 |
| 12.71 | 1 |
| 12.72 | 1 |
| 12.73 | 1 |
| 12.74 | 1 |
| 12.75 | 1 |
| 12.76 | 1 |
| 12.77 | 1 |
| 12.78 | 1 |
| 12.79 | 1 |
| 12.8 | 1 |
| 12.81 | 1 |
| 12.82 | 1 |
| 12.83 | 1 |
| 12.84 | 1 |
| 12.85 | 1 |
| 12.86 | 1 |
| 12.87 | 1 |
| 12.88 | 1 |
| 12.89 | 1 |
| 12.9 | 1 |
| 12.91 | 1 |
| 12.92 | 1 |
| 12.93 | 1 |
| 12.94 | 1 |
| 12.95 | 1 |
| 12.96 | 1 |
| 12.97 | 1 |
| 12.98 | 1 |
| 12.99 | 1 |
| 13.0 | 1 |
| 13.01 | 1 |
| 13.02 | 1 |
| 13.03 | 1 |
| 13.04 | 1 |
| 13.05 | 1 |
| 13.06 | 1 |
| 13.07 | 1 |
| 13.08 | 1 |
| 13.09 | 1 |
| 13.1 | 1 |
| 13.11 | 1 |
| 13.12 | 1 |
| 13.13 | 1 |
| 13.14 | 1 |
| 13.15 | 1 |
| 13.16 | 1 |
| 13.17 | 1 |
| 13.18 | 1 |
| 13.19 | 1 |
| 13.2 | 1 |
| 13.21 | 1 |
| 13.22 | 1 |
| 13.23 | 1 |
| 13.24 | 1 |
| 13.25 | 1 |
| 13.26 | 1 |
| 13.27 | 1 |
| 13.28 | 1 |
| 13.29 | 1 |
| 13.3 | 1 |
| 13.31 | 1 |
| 13.32 | 1 |
| 13.33 | 1 |
| 13.34 | 1 |
| 13.35 | 1 |
| 13.36 | 1 |
| 13.37 | 1 |
| 13.38 | 1 |
| 13.39 | 1 |
| 13.4 | 1 |
| 13.41 | 1 |
| 13.42 | 1 |
| 13.43 | 1 |
| 13.44 | 1 |
| 13.45 | 1 |
| 13.46 | 1 |
| 13.47 | 1 |
| 13.48 | 1 |
| 13.49 | 1 |
| 13.5 | 1 |
| 13.51 | 1 |
| 13.52 | 1 |
| 13.53 | 1 |
| 13.54 | 1 |
| 13.55 | 1 |
| 13.56 | 1 |
| 13.57 | 1 |
| 13.58 | 1 |
| 13.59 | 1 |
| 13.6 | 1 |
| 13.61 | 1 |
| 13.62 | 1 |
| 13.63 | 1 |
| 13.64 | 1 |
| 13.65 | 1 |
| 13.66 | 1 |
| 13.67 | 1 |
| 13.68 | 1 |
| 13.69 | 1 |
| 13.7 | 1 |
| 13.71 | 1 |
| 13.72 | 1 |
| 13.73 | 1 |
| 13.74 | 1 |
| 13.75 | 1 |
| 13.76 | 1 |
| 13.77 | 1 |
| 13.78 | 1 |
| 13.79 | 1 |
| 13.8 | 1 |
| 13.81 | 1 |
| 13.82 | 1 |
| 13.83 | 1 |
| 13.84 | 1 |
| 13.85 | 1 |
| 13.86 | 1 |
| 13.87 | 1 |
| 13.88 | 1 |
| 13.89 | 1 |
| 13.9 | 1 |
| 13.91 | 1 |
| 13.92 | 1 |
| 13.93 | 1 |
| 13.94 | 1 |
| 13.95 | 1 |
| 13.96 | 1 |
| 13.97 | 1 |
| 13.98 | 1 |
| 13.99 | 1 |
| 14.0 | 1 |
| 14.01 | 1 |
| 14.02 | 1 |
| 14.03 | 1 |
| 14.04 | 1 |
| 14.05 | 1 |
| 14.06 | 1 |
| 14.07 | 1 |
| 14.08 | 1 |
| 14.09 | 1 |
| 14.1 | 1 |
| 14.11 | 1 |
| 14.12 | 1 |
| 14.13 | 1 |
| 14.14 | 1 |
| 14.15 | 1 |
| 14.16 | 1 |
| 14.17 | 1 |
| 14.18 | 1 |
| 14.19 | 1 |
| 14.2 | 1 |
| 14.21 | 1 |
| 14.22 | 1 |
| 14.23 | 1 |
| 14.24 | 1 |
| 14.25 | 1 |
| 14.26 | 1 |
| 14.27 | 1 |
| 14.28 | 1 |
| 14.29 | 1 |
| 14.3 | 1 |
| 14.31 | 1 |
| 14.32 | 1 |
| 14.33 | 1 |
| 14.34 | 1 |
| 14.35 | 1 |
| 14.36 | 1 |
| 14.37 | 1 |
| 14.38 | 1 |
| 14.39 | 1 |
| 14.4 | 1 |
| 14.41 | 1 |
| 14.42 | 1 |
| 14.43 | 1 |
| 14.44 | 1 |
| 14.45 | 1 |
| 14.46 | 1 |
| 14.47 | 1 |
| 14.48 | 1 |
| 14.49 | 1 |
| 14.5 | 1 |
| 14.51 | 1 |
| 14.52 | 1 |
| 14.53 | 1 |
| 14.54 | 1 |
| 14.55 | 1 |
| 14.56 | 1 |
| 14.57 | 1 |
| 14.58 | 1 |
| 14.59 | 1 |
| 14.6 | 1 |
| 14.61 | 1 |
| 14.62 | 1 |
| 14.63 | 1 |
| 14.64 | 1 |
| 14.65 | 1 |
| 14.66 | 1 |
| 14.67 | 1 |
| 14.68 | 1 |
| 14.69 | 1 |
| 14.7 | 1 |
| 14.71 | 1 |
| 14.72 | 1 |
| 14.73 | 1 |
| 14.74 | 1 |
| 14.75 | 1 |
| 14.76 | 1 |
| 14.77 | 1 |
| 14.78 | 1 |
| 14.79 | 1 |
| 14.8 | 1 |
| 14.81 | 1 |
| 14.82 | 1 |
| 14.83 | 1 |
| 14.84 | 1 |
| 14.85 | 1 |
| 14.86 | 1 |
| 14.87 | 1 |
| 14.88 | 1 |
| 14.89 | 1 |
| 14.9 | 1 |
| 14.91 | 1 |
| 14.92 | 1 |
| 14.93 | 1 |
| 14.94 | 1 |
| 14.95 | 1 |
| 14.96 | 1 |
| 14.97 | 1 |
| 14.98 | 1 |
| 14.99 | 1 |
| 15.0 | 1 |
| 15.01 | 1 |
| 15.02 | 1 |
| 15.03 | 1 |
| 15.04 | 1 |
| 15.05 | 1 |
| 15.06 | 1 |
| 15.07 | 1 |
| 15.08 | 1 |
| 15.09 | 1 |
| 15.1 | 1 |
| 15.11 | 1 |
| 15.12 | 1 |
| 15.13 | 1 |
| 15.14 | 1 |
| 15.15 | 1 |
| 15.16 | 1 |
| 15.17 | 1 |
| 15.18 | 1 |
| 15.19 | 1 |
| 15.2 | 1 |
| 15.21 | 1 |
| 15.22 | 1 |
| 15.23 | 1 |
| 15.24 | 1 |
| 15.25 | 1 |
| 15.26 | 1 |
| 15.27 | 1 |
| 15.28 | 1 |
| 15.29 | 1 |
| 15.3 | 1 |
| 15.31 | 1 |
| 15.32 | 1 |
| 15.33 | 1 |
| 15.34 | 1 |
| 15.35 | 1 |
| 15.36 | 1 |
| 15.37 | 1 |
| 15.38 | 1 |
| 15.39 | 1 |
| 15.4 | 1 |
| 15.41 | 1 |
| 15.42 | 1 |
| 15.43 | 1 |
| 15.44 | 1 |
| 15.45 | 1 |
| 15.46 | 1 |
| 15.47 | 1 |
| 15.48 | 1 |
| 15.49 | 1 |
| 15.5 | 1 |
| 15.51 | 1 |
| 15.52 | 1 |
| 15.53 | 1 |
| 15.54 | 1 |
| 15.55 | 1 |
| 15.56 | 1 |
| 15.57 | 1 |
| 15.58 | 1 |
| 15.59 | 1 |
| 15.6 | 1 |
| 15.61 | 1 |
| 15.62 | 1 |
| 15.63 | 1 |
| 15.64 | 1 |
| 15.65 | 1 |
| 15.66 | 1 |
| 15.67 | 1 |
| 15.68 | 1 |
| 15.69 | 1 |
| 15.7 | 1 |
| 15.71 | 1 |
| 15.72 | 1 |
| 15.73 | 1 |
| 15.74 | 1 |
| 15.75 | 1 |
| 15.76 | 1 |
| 15.77 | 1 |
| 15.78 | 1 |
| 15.79 | 1 |
| 15.8 | 1 |
| 15.81 | 1 |
| 15.82 | 1 |
| 15.83 | 1 |
| 15.84 | 1 |
| 15.85 | 1 |
| 15.86 | 1 |
| 15.87 | 1 |
| 15.88 | 1 |
| 15.89 | 1 |
| 15.9 | 1 |
| 15.91 | 1 |
| 15.92 | 1 |
| 15.93 | 1 |
| 15.94 | 1 |
| 15.95 | 1 |
| 15.96 | 1 |
| 15.97 | 1 |
| 15.98 | 1 |
| 15.99 | 1 |
| 16.0 | 1 |
| 16.01 | 1 |
| 16.02 | 1 |
| 16.03 | 1 |
| 16.04 | 1 |
| 16.05 | 1 |
| 16.06 | 1 |
| 16.07 | 1 |
| 16.08 | 1 |
| 16.09 | 1 |
| 16.1 | 1 |
| 16.11 | 1 |
| 16.12 | 1 |
| 16.13 | 1 |
| 16.14 | 1 |
| 16.15 | 1 |
| 16.16 | 1 |
| 16.17 | 1 |
| 16.18 | 1 |
| 16.19 | 1 |
| 16.2 | 1 |
| 16.21 | 1 |
| 16.22 | 1 |
| 16.23 | 1 |
| 16.24 | 1 |
| 16.25 | 1 |
| 16.26 | 1 |
| 16.27 | 1 |
| 16.28 | 1 |
| 16.29 | 1 |
| 16.3 | 1 |
| 16.31 | 1 |
| 16.32 | 1 |
| 16.33 | 1 |
| 16.34 | 1 |
| 16.35 | 1 |
| 16.36 | 1 |
| 16.37 | 1 |
| 16.38 | 1 |
| 16.39 | 1 |
| 16.4 | 1 |
| 16.41 | 1 |
| 16.42 | 1 |
| 16.43 | 1 |
| 16.44 | 1 |
| 16.45 | 1 |
| 16.46 | 1 |
| 16.47 | 1 |
| 16.48 | 1 |
| 16.49 | 1 |
| 16.5 | 1 |
| 16.51 | 1 |
| 16.52 | 1 |
| 16.53 | 1 |
| 16.54 | 1 |
| 16.55 | 1 |
| 16.56 | 1 |
| 16.57 | 1 |
| 16.58 | 1 |
| 16.59 | 1 |
| 16.6 | 1 |
| 16.61 | 1 |
| 16.62 | 1 |
| 16.63 | 1 |
| 16.64 | 1 |
| 16.65 | 1 |
| 16.66 | 1 |
| 16.67 | 1 |
| 16.68 | 1 |
| 16.69 | 1 |
| 16.7 | 1 |
| 16.71 | 1 |
| 16.72 | 1 |
| 16.73 | 1 |
| 16.74 | 1 |
| 16.75 | 1 |
| 16.76 | 1 |
| 16.77 | 1 |
| 16.78 | 1 |
| 16.79 | 1 |
| 16.8 | 1 |
| 16.81 | 1 |
| 16.82 | 1 |
| 16.83 | 1 |
| 16.84 | 1 |
| 16.85 | 1 |
| 16.86 | 1 |
| 16.87 | 1 |
| 16.88 | 1 |
| 16.89 | 1 |
| 16.9 | 1 |
| 16.91 | 1 |
| 16.92 | 1 |
| 16.93 | 1 |
| 16.94 | 1 |
| 16.95 | 1 |
| 16.96 | 1 |
| 16.97 | 1 |
| 16.98 | 1 |
| 16.99 | 1 |
| 17.0 | 1 |
| 17.01 | 1 |
| 17.02 | 1 |
| 17.03 | 1 |
| 17.04 | 1 |
| 17.05 | 1 |
| 17.06 | 1 |
| 17.07 | 1 |
| 17.08 | 1 |
| 17.09 | 1 |
| 17.1 | 1 |
| 17.11 | 1 |
| 17.12 | 1 |
| 17.13 | 1 |
| 17.14 | 1 |
| 17.15 | 1 |
| 17.16 | 1 |
| 17.17 | 1 |
| 17.18 | 1 |
| 17.19 | 1 |
| 17.2 | 1 |
| 17.21 | 1 |
| 17.22 | 1 |
| 17.23 | 1 |
| 17.24 | 1 |
| 17.25 | 1 |
| 17.26 | 1 |
| 17.27 | 1 |
| 17.28 | 1 |
| 17.29 | 1 |
| 17.3 | 1 |
| 17.31 | 1 |
| 17.32 | 1 |
| 17.33 | 1 |
| 17.34 | 1 |
| 17.35 | 1 |
| 17.36 | 1 |
| 17.37 | 1 |
| 17.38 | 1 |
| 17.39 | 1 |
| 17.4 | 1 |
| 17.41 | 1 |
| 17.42 | 1 |
| 17.43 | 1 |
| 17.44 | 1 |
| 17.45 | 1 |
| 17.46 | 1 |
| 17.47 | 1 |
| 17.48 | 1 |
| 17.49 | 1 |
| 17.5 | 1 |
| 17.51 | 1 |
| 17.52 | 1 |
| 17.53 | 1 |
| 17.54 | 1 |
| 17.55 | 1 |
| 17.56 | 1 |
| 17.57 | 1 |
| 17.58 | 1 |
| 17.59 | 1 |
| 17.6 | 1 |
| 17.61 | 1 |
| 17.62 | 1 |
| 17.63 | 1 |
| 17.64 | 1 |
| 17.65 | 1 |
| 17.66 | 1 |
| 17.67 | 1 |
| 17.68 | 1 |
| 17.69 | 1 |
| 17.7 | 1 |
| 17.71 | 1 |
| 17.72 | 1 |
| 17.73 | 1 |
| 17.74 | 1 |
| 17.75 | 1 |
| 17.76 | 1 |
| 17.77 | 1 |
| 17.78 | 1 |
| 17.79 | 1 |
| 17.8 | 1 |
| 17.81 | 1 |
| 17.82 | 1 |
| 17.83 | 1 |
| 17.84 | 1 |
| 17.85 | 1 |
| 17.86 | 1 |
| 17.87 | 1 |
| 17.88 | 1 |
| 17.89 | 1 |
| 17.9 | 1 |
| 17.91 | 1 |
| 17.92 | 1 |
| 17.93 | 1 |
| 17.94 | 1 |
| 17.95 | 1 |
| 17.96 | 1 |
| 17.97 | 1 |
| 17.98 | 1 |
| 17.99 | 1 |
| 18.0 | 1 |
| 18.01 | 1 |
| 18.02 | 1 |
| 18.03 | 1 |
| 18.04 | 1 |
| 18.05 | 1 |
| 18.06 | 1 |
| 18.07 | 1 |
| 18.08 | 1 |
| 18.09 | 1 |
| 18.1 | 1 |
| 18.11 | 1 |
| 18.12 | 1 |
| 18.13 | 1 |
| 18.14 | 1 |
| 18.15 | 1 |
| 18.16 | 1 |
| 18.17 | 1 |
| 18.18 | 1 |
| 18.19 | 1 |
| 18.2 | 1 |
| 18.21 | 1 |
| 18.22 | 1 |
| 18.23 | 1 |
| 18.24 | 1 |
| 18.25 | 1 |
| 18.26 | 1 |
| 18.27 | 1 |
| 18.28 | 1 |
| 18.29 | 1 |
| 18.3 | 1 |
| 18.31 | 1 |
| 18.32 | 1 |
| 18.33 | 1 |
| 18.34 | 1 |
| 18.35 | 1 |
| 18.36 | 1 |
| 18.37 | 1 |
| 18.38 | 1 |
| 18.39 | 1 |
| 18.4 | 1 |
| 18.41 | 1 |
| 18.42 | 1 |
| 18.43 | 1 |
| 18.44 | 1 |
| 18.45 | 1 |
| 18.46 | 1 |
| 18.47 | 1 |
| 18.48 | 1 |
| 18.49 | 1 |
| 18.5 | 1 |
| 18.51 | 1 |
| 18.52 | 1 |
| 18.53 | 1 |
| 18.54 | 1 |
| 18.55 | 1 |
| 18.56 | 1 |
| 18.57 | 1 |
| 18.58 | 1 |
| 18.59 | 1 |
| 18.6 | 1 |
| 18.61 | 1 |
| 18.62 | 1 |
| 18.63 | 1 |
| 18.64 | 1 |
| 18.65 | 1 |
| 18.66 | 1 |
| 18.67 | 1 |
| 18.68 | 1 |
| 18.69 | 1 |
| 18.7 | 1 |
| 18.71 | 1 |
| 18.72 | 1 |
| 18.73 | 1 |
| 18.74 | 1 |
| 18.75 | 1 |
| 18.76 | 1 |
| 18.77 | 1 |
| 18.78 | 1 |
| 18.79 | 1 |
| 18.8 | 1 |
| 18.81 | 1 |
| 18.82 | 1 |
| 18.83 | 1 |
| 18.84 | 1 |
| 18.85 | 1 |
| 18.86 | 1 |
| 18.87 | 1 |
| 18.88 | 1 |
| 18.89 | 1 |
| 18.9 | 1 |
| 18.91 | 1 |
| 18.92 | 1 |
| 18.93 | 1 |
| 18.94 | 1 |
| 18.95 | 1 |
| 18.96 | 1 |
| 18.97 | 1 |
| 18.98 | 1 |
| 18.99 | 1 |
| 19.0 | 1 |
| 19.01 | 1 |
| 19.02 | 1 |
| 19.03 | 1 |
| 19.04 | 1 |
| 19.05 | 1 |
| 19.06 | 1 |
| 19.07 | 1 |
| 19.08 | 1 |
| 19.09 | 1 |
| 19.1 | 1 |
| 19.11 | 1 |
| 19.12 | 1 |
| 19.13 | 1 |
| 19.14 | 1 |
| 19.15 | 1 |
| 19.16 | 1 |
| 19.17 | 1 |
| 19.18 | 1 |
| 19.19 | 1 |
| 19.2 | 1 |
| 19.21 | 1 |
| 19.22 | 1 |
| 19.23 | 1 |
| 19.24 | 1 |
| 19.25 | 1 |
| 19.26 | 1 |
| 19.27 | 1 |
| 19.28 | 1 |
| 19.29 | 1 |
| 19.3 | 1 |
| 19.31 | 1 |
| 19.32 | 1 |
| 19.33 | 1 |
| 19.34 | 1 |
| 19.35 | 1 |
| 19.36 | 1 |
| 19.37 | 1 |
| 19.38 | 1 |
| 19.39 | 1 |
| 19.4 | 1 |
| 19.41 | 1 |
| 19.42 | 1 |
| 19.43 | 1 |
| 19.44 | 1 |
| 19.45 | 1 |
| 19.46 | 1 |
| 19.47 | 1 |
| 19.48 | 1 |
| 19.49 | 1 |
| 19.5 | 1 |
| 19.51 | 1 |
| 19.52 | 1 |
| 19.53 | 1 |
| 19.54 | 1 |
| 19.55 | 1 |
| 19.56 | 1 |
| 19.57 | 1 |
| 19.58 | 1 |
| 19.59 | 1 |
| 19.6 | 1 |
| 19.61 | 1 |
| 19.62 | 1 |
| 19.63 | 1 |
| 19.64 | 1 |
| 19.65 | 1 |
| 19.66 | 1 |
| 19.67 | 1 |
| 19.68 | 1 |
| 19.69 | 1 |
| 19.7 | 1 |
| 19.71 | 1 |
| 19.72 | 1 |
| 19.73 | 1 |
| 19.74 | 1 |
| 19.75 | 1 |
| 19.76 | 1 |
| 19.77 | 1 |
| 19.78 | 1 |
| 19.79 | 1 |
| 19.8 | 1 |
| 19.81 | 1 |
| 19.82 | 1 |
| 19.83 | 1 |
| 19.84 | 1 |
| 19.85 | 1 |
| 19.86 | 1 |
| 19.87 | 1 |
| 19.88 | 1 |
| 19.89 | 1 |
| 19.9 | 1 |
| 19.91 | 1 |
| 19.92 | 1 |
| 19.93 | 1 |
| 19.94 | 1 |
| 19.95 | 1 |
| 19.96 | 1 |
| 19.97 | 1 |
| 19.98 | 1 |
| 19.99 | 1 |
| 20.0 | 1 |
| 20.01 | 1 |
| 20.02 | 1 |
| 20.03 | 1 |
| 20.04 | 1 |
| 20.05 | 1 |
| 20.06 | 1 |
| 20.07 | 1 |
| 20.08 | 1 |
| 20.09 | 1 |
| 20.1 | 1 |
| 20.11 | 1 |
| 20.12 | 1 |
| 20.13 | 1 |
| 20.14 | 1 |
| 20.15 | 1 |
| 20.16 | 1 |
| 20.17 | 1 |
| 20.18 | 1 |
| 20.19 | 1 |
| 20.2 | 1 |
| 20.21 | 1 |
| 20.22 | 1 |
| 20.23 | 1 |
| 20.24 | 1 |
| 20.25 | 1 |
| 20.26 | 1 |
| 20.27 | 1 |
| 20.28 | 1 |
| 20.29 | 1 |
| 20.3 | 1 |
| 20.31 | 1 |
| 20.32 | 1 |
| 20.33 | 1 |
| 20.34 | 1 |
| 20.35 | 1 |
| 20.36 | 1 |
| 20.37 | 1 |
| 20.38 | 1 |
| 20.39 | 1 |
| 20.4 | 1 |
| 20.41 | 1 |
| 20.42 | 1 |
| 20.43 | 1 |
| 20.44 | 1 |
| 20.45 | 1 |
| 20.46 | 1 |
| 20.47 | 1 |
| 20.48 | 1 |
| 20.49 | 1 |
| 20.5 | 1 |
| 20.51 | 1 |
| 20.52 | 1 |
| 20.53 | 1 |
| 20.54 | 1 |
| 20.55 | 1 |
| 20.56 | 1 |
| 20.57 | 1 |
| 20.58 | 1 |
| 20.59 | 1 |
| 20.6 | 1 |
| 20.61 | 1 |
| 20.62 | 1 |
| 20.63 | 1 |
| 20.64 | 1 |
| 20.65 | 1 |
| 20.66 | 1 |
| 20.67 | 1 |
| 20.68 | 1 |
| 20.69 | 1 |
| 20.7 | 1 |
| 20.71 | 1 |
| 20.72 | 1 |
| 20.73 | 1 |
| 20.74 | 1 |
| 20.75 | 1 |
| 20.76 | 1 |
| 20.77 | 1 |
| 20.78 | 1 |
| 20.79 | 1 |
| 20.8 | 1 |
| 20.81 | 1 |
| 20.82 | 1 |
| 20.83 | 1 |
| 20.84 | 1 |
| 20.85 | 1 |
| 20.86 | 1 |
| 20.87 | 1 |
| 20.88 | 1 |
| 20.89 | 1 |
| 20.9 | 1 |
| 20.91 | 1 |
| 20.92 | 1 |
| 20.93 | 1 |
| 20.94 | 1 |
| 20.95 | 1 |
| 20.96 | 1 |
| 20.97 | 1 |
| 20.98 | 1 |
| 20.99 | 1 |
| 21.0 | 1 |
| 21.01 | 1 |
| 21.02 | 1 |
| 21.03 | 1 |
| 21.04 | 1 |
| 21.05 | 1 |
| 21.06 | 1 |
| 21.07 | 1 |
| 21.08 | 1 |
| 21.09 | 1 |
| 21.1 | 1 |
| 21.11 | 1 |
| 21.12 | 1 |
| 21.13 | 1 |
| 21.14 | 1 |
| 21.15 | 1 |
| 21.16 | 1 |
| 21.17 | 1 |
| 21.18 | 1 |
| 21.19 | 1 |
| 21.2 | 1 |
| 21.21 | 1 |
| 21.22 | 1 |
| 21.23 | 1 |
| 21.24 | 1 |
| 21.25 | 1 |
| 21.26 | 1 |
| 21.27 | 1 |
| 21.28 | 1 |
| 21.29 | 1 |
| 21.3 | 1 |
| 21.31 | 1 |
| 21.32 | 1 |
| 21.33 | 1 |
| 21.34 | 1 |
| 21.35 | 1 |
| 21.36 | 1 |
| 21.37 | 1 |
| 21.38 | 1 |
| 21.39 | 1 |
| 21.4 | 1 |
| 21.41 | 1 |
| 21.42 | 1 |
| 21.43 | 1 |
| 21.44 | 1 |
| 21.45 | 1 |
| 21.46 | 1 |
| 21.47 | 1 |
| 21.48 | 1 |
| 21.49 | 1 |
| 21.5 | 1 |
| 21.51 | 1 |
| 21.52 | 1 |
| 21.53 | 1 |
| 21.54 | 1 |
| 21.55 | 1 |
| 21.56 | 1 |
| 21.57 | 1 |
| 21.58 | 1 |
| 21.59 | 1 |
| 21.6 | 1 |
| 21.61 | 1 |
| 21.62 | 1 |
| 21.63 | 1 |
| 21.64 | 1 |
| 21.65 | 1 |
| 21.66 | 1 |
| 21.67 | 1 |
| 21.68 | 1 |
| 21.69 | 1 |
| 21.7 | 1 |
| 21.71 | 1 |
| 21.72 | 1 |
| 21.73 | 1 |
| 21.74 | 1 |
| 21.75 | 1 |
| 21.76 | 1 |
| 21.77 | 1 |
| 21.78 | 1 |
| 21.79 | 1 |
| 21.8 | 1 |
| 21.81 | 1 |
| 21.82 | 1 |
| 21.83 | 1 |
| 21.84 | 1 |
| 21.85 | 1 |
| 21.86 | 1 |
| 21.87 | 1 |
| 21.88 | 1 |
| 21.89 | 1 |
| 21.9 | 1 |
| 21.91 | 1 |
| 21.92 | 1 |
| 21.93 | 1 |
| 21.94 | 1 |
| 21.95 | 1 |
| 21.96 | 1 |
| 21.97 | 1 |
| 21.98 | 1 |
| 21.99 | 1 |
| 22.0 | 1 |
| 22.01 | 1 |
| 22.02 | 1 |
| 22.03 | 1 |
| 22.04 | 1 |
| 22.05 | 1 |
| 22.06 | 1 |
| 22.07 | 1 |
| 22.08 | 1 |
| 22.09 | 1 |
| 22.1 | 1 |
| 22.11 | 1 |
| 22.12 | 1 |
| 22.13 | 1 |
| 22.14 | 1 |
| 22.15 | 1 |
| 22.16 | 1 |
| 22.17 | 1 |
| 22.18 | 1 |
| 22.19 | 1 |
| 22.2 | 1 |
| 22.21 | 1 |
| 22.22 | 1 |
| 22.23 | 1 |
| 22.24 | 1 |
| 22.25 | 1 |
| 22.26 | 1 |
| 22.27 | 1 |
| 22.28 | 1 |
| 22.29 | 1 |
| 22.3 | 1 |
| 22.31 | 1 |
| 22.32 | 1 |
| 22.33 | 1 |
| 22.34 | 1 |
| 22.35 | 1 |
| 22.36 | 1 |
| 22.37 | 1 |
| 22.38 | 1 |
| 22.39 | 1 |
| 22.4 | 1 |
| 22.41 | 1 |
| 22.42 | 1 |
| 22.43 | 1 |
| 22.44 | 1 |
| 22.45 | 1 |
| 22.46 | 1 |
| 22.47 | 1 |
| 22.48 | 1 |
| 22.49 | 1 |
| 22.5 | 1 |
| 22.51 | 1 |
| 22.52 | 1 |
| 22.53 | 1 |
| 22.54 | 1 |
| 22.55 | 1 |
| 22.56 | 1 |
| 22.57 | 1 |
| 22.58 | 1 |
| 22.59 | 1 |
| 22.6 | 1 |
| 22.61 | 1 |
| 22.62 | 1 |
| 22.63 | 1 |
| 22.64 | 1 |
| 22.65 | 1 |
| 22.66 | 1 |
| 22.67 | 1 |
| 22.68 | 1 |
| 22.69 | 1 |
| 22.7 | 1 |
| 22.71 | 1 |
| 22.72 | 1 |
| 22.73 | 1 |
| 22.74 | 1 |
| 22.75 | 1 |
| 22.76 | 1 |
| 22.77 | 1 |
| 22.78 | 1 |
| 22.79 | 1 |
| 22.8 | 1 |
| 22.81 | 1 |
| 22.82 | 1 |
| 22.83 | 1 |
| 22.84 | 1 |
| 22.85 | 1 |
| 22.86 | 1 |
| 22.87 | 1 |
| 22.88 | 1 |
| 22.89 | 1 |
| 22.9 | 1 |
| 22.91 | 1 |
| 22.92 | 1 |
| 22.93 | 1 |
| 22.94 | 1 |
| 22.95 | 1 |
| 22.96 | 1 |
| 22.97 | 1 |
| 22.98 | 1 |
| 22.99 | 1 |
| 23.0 | 1 |
| 23.01 | 1 |
| 23.02 | 1 |
| 23.03 | 1 |
| 23.04 | 1 |
| 23.05 | 1 |
| 23.06 | 1 |
| 23.07 | 1 |
| 23.08 | 1 |
| 23.09 | 1 |
| 23.1 | 1 |
| 23.11 | 1 |
| 23.12 | 1 |
| 23.13 | 1 |
| 23.14 | 1 |
| 23.15 | 1 |
| 23.16 | 1 |
| 23.17 | 1 |
| 23.18 | 1 |
| 23.19 | 1 |
| 23.2 | 1 |
| 23.21 | 1 |
| 23.22 | 1 |
| 23.23 | 1 |
| 23.24 | 1 |
| 23.25 | 1 |
| 23.26 | 1 |
| 23.27 | 1 |
| 23.28 | 1 |
| 23.29 | 1 |
| 23.3 | 1 |
| 23.31 | 1 |
| 23.32 | 1 |
| 23.33 | 1 |
| 23.34 | 1 |
| 23.35 | 1 |
| 23.36 | 1 |
| 23.37 | 1 |
| 23.38 | 1 |
| 23.39 | 1 |
| 23.4 | 1 |
| 23.41 | 1 |
| 23.42 | 1 |
| 23.43 | 1 |
| 23.44 | 1 |
| 23.45 | 1 |
| 23.46 | 1 |
| 23.47 | 1 |
| 23.48 | 1 |
| 23.49 | 1 |
| 23.5 | 1 |
| 23.51 | 1 |
| 23.52 | 1 |
| 23.53 | 1 |
| 23.54 | 1 |
| 23.55 | 1 |
| 23.56 | 1 |
| 23.57 | 1 |
| 23.58 | 1 |
| 23.59 | 1 |
| 23.6 | 1 |
| 23.61 | 1 |
| 23.62 | 1 |
| 23.63 | 1 |
| 23.64 | 1 |
| 23.65 | 1 |
| 23.66 | 1 |
| 23.67 | 1 |
| 23.68 | 1 |
| 23.69 | 1 |
| 23.7 | 1 |
| 23.71 | 1 |
| 23.72 | 1 |
| 23.73 | 1 |
| 23.74 | 1 |
| 23.75 | 1 |
| 23.76 | 1 |
| 23.77 | 1 |
| 23.78 | 1 |
| 23.79 | 1 |
| 23.8 | 1 |
| 23.81 | 1 |
| 23.82 | 1 |
| 23.83 | 1 |
| 23.84 | 1 |
| 23.85 | 1 |
| 23.86 | 1 |
| 23.87 | 1 |
| 23.88 | 1 |
| 23.89 | 1 |
| 23.9 | 1 |
| 23.91 | 1 |
| 23.92 | 1 |
| 23.93 | 1 |
| 23.94 | 1 |
| 23.95 | 1 |
| 23.96 | 1 |
| 23.97 | 1 |
| 23.98 | 1 |
| 23.99 | 1 |
| 24.0 | 1 |
| 24.01 | 1 |
| 24.02 | 1 |
| 24.03 | 1 |
| 24.04 | 1 |
| 24.05 | 1 |
| 24.06 | 1 |
| 24.07 | 1 |
| 24.08 | 1 |
| 24.09 | 1 |
| 24.1 | 1 |
| 24.11 | 1 |
| 24.12 | 1 |
| 24.13 | 1 |
| 24.14 | 1 |
| 24.15 | 1 |
| 24.16 | 1 |
| 24.17 | 1 |
| 24.18 | 1 |
| 24.19 | 1 |
| 24.2 | 1 |
| 24.21 | 1 |
| 24.22 | 1 |
| 24.23 | 1 |
| 24.24 | 1 |
| 24.25 | 1 |
| 24.26 | 1 |
| 24.27 | 1 |
| 24.28 | 1 |
| 24.29 | 1 |
| 24.3 | 1 |
| 24.31 | 1 |
| 24.32 | 1 |
| 24.33 | 1 |
| 24.34 | 1 |
| 24.35 | 1 |
| 24.36 | 1 |
| 24.37 | 1 |
| 24.38 | 1 |
| 24.39 | 1 |
| 24.4 | 1 |
| 24.41 | 1 |
| 24.42 | 1 |
| 24.43 | 1 |
| 24.44 | 1 |
| 24.45 | 1 |
| 24.46 | 1 |
| 24.47 | 1 |
| 24.48 | 1 |
| 24.49 | 1 |
| 24.5 | 1 |
| 24.51 | 1 |
| 24.52 | 1 |
| 24.53 | 1 |
| 24.54 | 1 |
| 24.55 | 1 |
| 24.56 | 1 |
| 24.57 | 1 |
| 24.58 | 1 |
| 24.59 | 1 |
| 24.6 | 1 |
| 24.61 | 1 |
| 24.62 | 1 |
| 24.63 | 1 |
| 24.64 | 1 |
| 24.65 | 1 |
| 24.66 | 1 |
| 24.67 | 1 |
| 24.68 | 1 |
| 24.69 | 1 |
| 24.7 | 1 |
| 24.71 | 1 |
| 24.72 | 1 |
| 24.73 | 1 |
| 24.74 | 1 |
| 24.75 | 1 |
| 24.76 | 1 |
| 24.77 | 1 |
| 24.78 | 1 |
| 24.79 | 1 |
| 24.8 | 1 |
| 24.81 | 1 |
| 24.82 | 1 |
| 24.83 | 1 |
| 24.84 | 1 |
| 24.85 | 1 |
| 24.86 | 1 |
| 24.87 | 1 |
| 24.88 | 1 |
| 24.89 | 1 |
| 24.9 | 1 |
| 24.91 | 1 |
| 24.92 | 1 |
| 24.93 | 1 |
| 24.94 | 1 |
| 24.95 | 1 |
| 24.96 | 1 |
| 24.97 | 1 |
| 24.98 | 1 |
| 24.99 | 1 |
| 25.0 | 1 |
| 25.01 | 1 |
| 25.02 | 1 |
| 25.03 | 1 |
| 25.04 | 1 |
| 25.05 | 1 |
| 25.06 | 1 |
| 25.07 | 1 |
| 25.08 | 1 |
| 25.09 | 1 |
| 25.1 | 1 |
| 25.11 | 1 |
| 25.12 | 1 |
| 25.13 | 1 |
| 25.14 | 1 |
| 25.15 | 1 |
| 25.16 | 1 |
| 25.17 | 1 |
| 25.18 | 1 |
| 25.19 | 1 |
| 25.2 | 1 |
| 25.21 | 1 |
| 25.22 | 1 |
| 25.23 | 1 |
| 25.24 | 1 |
| 25.25 | 1 |
| 25.26 | 1 |
| 25.27 | 1 |
| 25.28 | 1 |
| 25.29 | 1 |
| 25.3 | 1 |
| 25.31 | 1 |
| 25.32 | 1 |
| 25.33 | 1 |
| 25.34 | 1 |
| 25.35 | 1 |
| 25.36 | 1 |
| 25.37 | 1 |
| 25.38 | 1 |
| 25.39 | 1 |
| 25.4 | 1 |
| 25.41 | 1 |
| 25.42 | 1 |
| 25.43 | 1 |
| 25.44 | 1 |
| 25.45 | 1 |
| 25.46 | 1 |
| 25.47 | 1 |
| 25.48 | 1 |
| 25.49 | 1 |
| 25.5 | 1 |
| 25.51 | 1 |
| 25.52 | 1 |
| 25.53 | 1 |
| 25.54 | 1 |
| 25.55 | 1 |
| 25.56 | 1 |
| 25.57 | 1 |
| 25.58 | 1 |
| 25.59 | 1 |
| 25.6 | 1 |
| 25.61 | 1 |
| 25.62 | 1 |
| 25.63 | 1 |
| 25.64 | 1 |
| 25.65 | 1 |
| 25.66 | 1 |
| 25.67 | 1 |
| 25.68 | 1 |
| 25.69 | 1 |
| 25.7 | 1 |
| 25.71 | 1 |
| 25.72 | 1 |
| 25.73 | 1 |
| 25.74 | 1 |
| 25.75 | 1 |
| 25.76 | 1 |
| 25.77 | 1 |
| 25.78 | 1 |
| 25.79 | 1 |
| 25.8 | 1 |
| 25.81 | 1 |
| 25.82 | 1 |
| 25.83 | 1 |
| 25.84 | 1 |
| 25.85 | 1 |
| 25.86 | 1 |
| 25.87 | 1 |
| 25.88 | 1 |
| 25.89 | 1 |
| 25.9 | 1 |
| 25.91 | 1 |
| 25.92 | 1 |
| 25.93 | 1 |
| 25.94 | 1 |
| 25.95 | 1 |
| 25.96 | 1 |
| 25.97 | 1 |
| 25.98 | 1 |
| 25.99 | 1 |
| 26.0 | 1 |
| 26.01 | 1 |
| 26.02 | 1 |
| 26.03 | 1 |
| 26.04 | 1 |
| 26.05 | 1 |
| 26.06 | 1 |
| 26.07 | 1 |
| 26.08 | 1 |
| 26.09 | 1 |
| 26.1 | 1 |
| 26.11 | 1 |
| 26.12 | 1 |
| 26.13 | 1 |
| 26.14 | 1 |
| 26.15 | 1 |
| 26.16 | 1 |
| 26.17 | 1 |
| 26.18 | 1 |
| 26.19 | 1 |
| 26.2 | 1 |
| 26.21 | 1 |
| 26.22 | 1 |
| 26.23 | 1 |
| 26.24 | 1 |
| 26.25 | 1 |
| 26.26 | 1 |
| 26.27 | 1 |
| 26.28 | 1 |
| 26.29 | 1 |
| 26.3 | 1 |
| 26.31 | 1 |
| 26.32 | 1 |
| 26.33 | 1 |
| 26.34 | 1 |
| 26.35 | 1 |
| 26.36 | 1 |
| 26.37 | 1 |
| 26.38 | 1 |
| 26.39 | 1 |
| 26.4 | 1 |
| 26.41 | 1 |
| 26.42 | 1 |
| 26.43 | 1 |
| 26.44 | 1 |
| 26.45 | 1 |
| 26.46 | 1 |
| 26.47 | 1 |
| 26.48 | 1 |
| 26.49 | 1 |
| 26.5 | 1 |
| 26.51 | 1 |
| 26.52 | 1 |
| 26.53 | 1 |
| 26.54 | 1 |
| 26.55 | 1 |
| 26.56 | 1 |
| 26.57 | 1 |
| 26.58 | 1 |
| 26.59 | 1 |
| 26.6 | 1 |
| 26.61 | 1 |
| 26.62 | 1 |
| 26.63 | 1 |
| 26.64 | 1 |
| 26.65 | 1 |
| 26.66 | 1 |
| 26.67 | 1 |
| 26.68 | 1 |
| 26.69 | 1 |
| 26.7 | 1 |
| 26.71 | 1 |
| 26.72 | 1 |
| 26.73 | 1 |
| 26.74 | 1 |
| 26.75 | 1 |
| 26.76 | 1 |
| 26.77 | 1 |
| 26.78 | 1 |
| 26.79 | 1 |
| 26.8 | 1 |
| 26.81 | 1 |
| 26.82 | 1 |
| 26.83 | 1 |
| 26.84 | 1 |
| 26.85 | 1 |
| 26.86 | 1 |
| 26.87 | 1 |
| 26.88 | 1 |
| 26.89 | 1 |
| 26.9 | 1 |
| 26.91 | 1 |
| 26.92 | 1 |
| 26.93 | 1 |
| 26.94 | 1 |
| 26.95 | 1 |
| 26.96 | 1 |
| 26.97 | 1 |
| 26.98 | 1 |
| 26.99 | 1 |
| 27.0 | 1 |
| 27.01 | 1 |
| 27.02 | 1 |
| 27.03 | 1 |
| 27.04 | 1 |
| 27.05 | 1 |
| 27.06 | 1 |
| 27.07 | 1 |
| 27.08 | 1 |
| 27.09 | 1 |
| 27.1 | 1 |
| 27.11 | 1 |
| 27.12 | 1 |
| 27.13 | 1 |
| 27.14 | 1 |
| 27.15 | 1 |
| 27.16 | 1 |
| 27.17 | 1 |
| 27.18 | 1 |
| 27.19 | 1 |
| 27.2 | 1 |
| 27.21 | 1 |
| 27.22 | 1 |
| 27.23 | 1 |
| 27.24 | 1 |
| 27.25 | 1 |
| 27.26 | 1 |
| 27.27 | 1 |
| 27.28 | 1 |
| 27.29 | 1 |
| 27.3 | 1 |
| 27.31 | 1 |
| 27.32 | 1 |
| 27.33 | 1 |
| 27.34 | 1 |
| 27.35 | 1 |
| 27.36 | 1 |
| 27.37 | 1 |
| 27.38 | 1 |
| 27.39 | 1 |
| 27.4 | 1 |
| 27.41 | 1 |
| 27.42 | 1 |
| 27.43 | 1 |
| 27.44 | 1 |
| 27.45 | 1 |
| 27.46 | 1 |
| 27.47 | 1 |
| 27.48 | 1 |
| 27.49 | 1 |
| 27.5 | 1 |
| 27.51 | 1 |
| 27.52 | 1 |
| 27.53 | 1 |
| 27.54 | 1 |
| 27.55 | 1 |
| 27.56 | 1 |
| 27.57 | 1 |
| 27.58 | 1 |
| 27.59 | 1 |
| 27.6 | 1 |
| 27.61 | 1 |
| 27.62 | 1 |
| 27.63 | 1 |
| 27.64 | 1 |
| 27.65 | 1 |
| 27.66 | 1 |
| 27.67 | 1 |
| 27.68 | 1 |
| 27.69 | 1 |
| 27.7 | 1 |
| 27.71 | 1 |
| 27.72 | 1 |
| 27.73 | 1 |
| 27.74 | 1 |
| 27.75 | 1 |
| 27.76 | 1 |
| 27.77 | 1 |
| 27.78 | 1 |
| 27.79 | 1 |
| 27.8 | 1 |
| 27.81 | 1 |
| 27.82 | 1 |
| 27.83 | 1 |
| 27.84 | 1 |
| 27.85 | 1 |
| 27.86 | 1 |
| 27.87 | 1 |
| 27.88 | 1 |
| 27.89 | 1 |
| 27.9 | 1 |
| 27.91 | 1 |
| 27.92 | 1 |
| 27.93 | 1 |
| 27.94 | 1 |
| 27.95 | 1 |
| 27.96 | 1 |
| 27.97 | 1 |
| 27.98 | 1 |
| 27.99 | 1 |
| 28.0 | 1 |
| 28.01 | 1 |
| 28.02 | 1 |
| 28.03 | 1 |
| 28.04 | 1 |
| 28.05 | 1 |
| 28.06 | 1 |
| 28.07 | 1 |
| 28.08 | 1 |
| 28.09 | 1 |
| 28.1 | 1 |
| 28.11 | 1 |
| 28.12 | 1 |
| 28.13 | 1 |
| 28.14 | 1 |
| 28.15 | 1 |
| 28.16 | 1 |
| 28.17 | 1 |
| 28.18 | 1 |
| 28.19 | 1 |
| 28.2 | 1 |
| 28.21 | 1 |
| 28.22 | 1 |
| 28.23 | 1 |
| 28.24 | 1 |
| 28.25 | 1 |
| 28.26 | 1 |
| 28.27 | 1 |
| 28.28 | 1 |
| 28.29 | 1 |
| 28.3 | 1 |
| 28.31 | 1 |
| 28.32 | 1 |
| 28.33 | 1 |
| 28.34 | 1 |
| 28.35 | 1 |
| 28.36 | 1 |
| 28.37 | 1 |
| 28.38 | 1 |
| 28.39 | 1 |
| 28.4 | 1 |
| 28.41 | 1 |
| 28.42 | 1 |
| 28.43 | 1 |
| 28.44 | 1 |
| 28.45 | 1 |
| 28.46 | 1 |
| 28.47 | 1 |
| 28.48 | 1 |
| 28.49 | 1 |
| 28.5 | 1 |
| 28.51 | 1 |
| 28.52 | 1 |
| 28.53 | 1 |
| 28.54 | 1 |
| 28.55 | 1 |
| 28.56 | 1 |
| 28.57 | 1 |
| 28.58 | 1 |
| 28.59 | 1 |
| 28.6 | 1 |
| 28.61 | 1 |
| 28.62 | 1 |
| 28.63 | 1 |
| 28.64 | 1 |
| 28.65 | 1 |
| 28.66 | 1 |
| 28.67 | 1 |
| 28.68 | 1 |
| 28.69 | 1 |
| 28.7 | 1 |
| 28.71 | 1 |
| 28.72 | 1 |
| 28.73 | 1 |
| 28.74 | 1 |
| 28.75 | 1 |
| 28.76 | 1 |
| 28.77 | 1 |
| 28.78 | 1 |
| 28.79 | 1 |
| 28.8 | 1 |
| 28.81 | 1 |
| 28.82 | 1 |
| 28.83 | 1 |
| 28.84 | 1 |
| 28.85 | 1 |
| 28.86 | 1 |
| 28.87 | 1 |
| 28.88 | 1 |
| 28.89 | 1 |
| 28.9 | 1 |
| 28.91 | 1 |
| 28.92 | 1 |
| 28.93 | 1 |
| 28.94 | 1 |
| 28.95 | 1 |
| 28.96 | 1 |
| 28.97 | 1 |
| 28.98 | 1 |
| 28.99 | 1 |
| 29.0 | 1 |
| 29.01 | 1 |
| 29.02 | 1 |
| 29.03 | 1 |
| 29.04 | 1 |
| 29.05 | 1 |
| 29.06 | 1 |
| 29.07 | 1 |
| 29.08 | 1 |
| 29.09 | 1 |
| 29.1 | 1 |
| 29.11 | 1 |
| 29.12 | 1 |
| 29.13 | 1 |
| 29.14 | 1 |
| 29.15 | 1 |
| 29.16 | 1 |
| 29.17 | 1 |
| 29.18 | 1 |
| 29.19 | 1 |
| 29.2 | 1 |
| 29.21 | 1 |
| 29.22 | 1 |
| 29.23 | 1 |
| 29.24 | 1 |
| 29.25 | 1 |
| 29.26 | 1 |
| 29.27 | 1 |
| 29.28 | 1 |
| 29.29 | 1 |
| 29.3 | 1 |
| 29.31 | 1 |
| 29.32 | 1 |
| 29.33 | 1 |
| 29.34 | 1 |
| 29.35 | 1 |
| 29.36 | 1 |
| 29.37 | 1 |
| 29.38 | 1 |
| 29.39 | 1 |
| 29.4 | 1 |
| 29.41 | 1 |
| 29.42 | 1 |
| 29.43 | 1 |
| 29.44 | 1 |
| 29.45 | 1 |
| 29.46 | 1 |
| 29.47 | 1 |
| 29.48 | 1 |
| 29.49 | 1 |
| 29.5 | 1 |
| 29.51 | 1 |
| 29.52 | 1 |
| 29.53 | 1 |
| 29.54 | 1 |
| 29.55 | 1 |
| 29.56 | 1 |
| 29.57 | 1 |
| 29.58 | 1 |
| 29.59 | 1 |
| 29.6 | 1 |
| 29.61 | 1 |
| 29.62 | 1 |
| 29.63 | 1 |
| 29.64 | 1 |
| 29.65 | 1 |
| 29.66 | 1 |
| 29.67 | 1 |
| 29.68 | 1 |
| 29.69 | 1 |
| 29.7 | 1 |
| 29.71 | 1 |
| 29.72 | 1 |
| 29.73 | 1 |
| 29.74 | 1 |
| 29.75 | 1 |
| 29.76 | 1 |
| 29.77 | 1 |
| 29.78 | 1 |
| 29.79 | 1 |
| 29.8 | 1 |
| 29.81 | 1 |
| 29.82 | 1 |
| 29.83 | 1 |
| 29.84 | 1 |
| 29.85 | 1 |
| 29.86 | 1 |
| 29.87 | 1 |
| 29.88 | 1 |
| 29.89 | 1 |
| 29.9 | 1 |
| 29.91 | 1 |
| 29.92 | 1 |
| 29.93 | 1 |
| 29.94 | 1 |
| 29.95 | 1 |
| 29.96 | 1 |
| 29.97 | 1 |
| 29.98 | 1 |
| 29.99 | 1 |
| 30.0 | 1 |
| 30.01 | 1 |
| 30.02 | 1 |
| 30.03 | 1 |
| 30.04 | 1 |
| 30.05 | 1 |
| 30.06 | 1 |
| 30.07 | 1 |
| 30.08 | 1 |
| 30.09 | 1 |
| 30.1 | 1 |
| 30.11 | 1 |
| 30.12 | 1 |
| 30.13 | 1 |
| 30.14 | 1 |
| 30.15 | 1 |
| 30.16 | 1 |
| 30.17 | 1 |
| 30.18 | 1 |
| 30.19 | 1 |
| 30.2 | 1 |
| 30.21 | 1 |
| 30.22 | 1 |
| 30.23 | 1 |
| 30.24 | 1 |
| 30.25 | 1 |
| 30.26 | 1 |
| 30.27 | 1 |
| 30.28 | 1 |
| 30.29 | 1 |
| 30.3 | 1 |
| 30.31 | 1 |
| 30.32 | 1 |
| 30.33 | 1 |
| 30.34 | 1 |
| 30.35 | 1 |
| 30.36 | 1 |
| 30.37 | 1 |
| 30.38 | 1 |
| 30.39 | 1 |
| 30.4 | 1 |
| 30.41 | 1 |
| 30.42 | 1 |
| 30.43 | 1 |
| 30.44 | 1 |
| 30.45 | 1 |
| 30.46 | 1 |
| 30.47 | 1 |
| 30.48 | 1 |
| 30.49 | 1 |
| 30.5 | 1 |
| 30.51 | 1 |
| 30.52 | 1 |
| 30.53 | 1 |
| 30.54 | 1 |
| 30.55 | 1 |
| 30.56 | 1 |
| 30.57 | 1 |
| 30.58 | 1 |
| 30.59 | 1 |
| 30.6 | 1 |
| 30.61 | 1 |
| 30.62 | 1 |
| 30.63 | 1 |
| 30.64 | 1 |
| 30.65 | 1 |
| 30.66 | 1 |
| 30.67 | 1 |
| 30.68 | 1 |
| 30.69 | 1 |
| 30.7 | 1 |
| 30.71 | 1 |
| 30.72 | 1 |
| 30.73 | 1 |
| 30.74 | 1 |
| 30.75 | 1 |
| 30.76 | 1 |
| 30.77 | 1 |
| 30.78 | 1 |
| 30.79 | 1 |
| 30.8 | 1 |
| 30.81 | 1 |
| 30.82 | 1 |
| 30.83 | 1 |
| 30.84 | 1 |
| 30.85 | 1 |
| 30.86 | 1 |
| 30.87 | 1 |
| 30.88 | 1 |
| 30.89 | 1 |
| 30.9 | 1 |
| 30.91 | 1 |
| 30.92 | 1 |
| 30.93 | 1 |
| 30.94 | 1 |
| 30.95 | 1 |
| 30.96 | 1 |
| 30.97 | 1 |
| 30.98 | 1 |
| 30.99 | 1 |
| 31.0 | 1 |
| 31.01 | 1 |
| 31.02 | 1 |
| 31.03 | 1 |
| 31.04 | 1 |
| 31.05 | 1 |
| 31.06 | 1 |
| 31.07 | 1 |
| 31.08 | 1 |
| 31.09 | 1 |
| 31.1 | 1 |
| 31.11 | 1 |
| 31.12 | 1 |
| 31.13 | 1 |
| 31.14 | 1 |
| 31.15 | 1 |
| 31.16 | 1 |
| 31.17 | 1 |
| 31.18 | 1 |
| 31.19 | 1 |
| 31.2 | 1 |
| 31.21 | 1 |
| 31.22 | 1 |
| 31.23 | 1 |
| 31.24 | 1 |
| 31.25 | 1 |
| 31.26 | 1 |
| 31.27 | 1 |
| 31.28 | 1 |
| 31.29 | 1 |
| 31.3 | 1 |
| 31.31 | 1 |
| 31.32 | 1 |
| 31.33 | 1 |
| 31.34 | 1 |
| 31.35 | 1 |
| 31.36 | 1 |
| 31.37 | 1 |
| 31.38 | 1 |
| 31.39 | 1 |
| 31.4 | 1 |
| 31.41 | 1 |
| 31.42 | 1 |
| 31.43 | 1 |
| 31.44 | 1 |
| 31.45 | 1 |
| 31.46 | 1 |
| 31.47 | 1 |
| 31.48 | 1 |
| 31.49 | 1 |
| 31.5 | 1 |
| 31.51 | 1 |
| 31.52 | 1 |
| 31.53 | 1 |
| 31.54 | 1 |
| 31.55 | 1 |
| 31.56 | 1 |
| 31.57 | 1 |
| 31.58 | 1 |
| 31.59 | 1 |
| 31.6 | 1 |
| 31.61 | 1 |
| 31.62 | 1 |
| 31.63 | 1 |
| 31.64 | 1 |
| 31.65 | 1 |
| 31.66 | 1 |
| 31.67 | 1 |
| 31.68 | 1 |
| 31.69 | 1 |
| 31.7 | 1 |
| 31.71 | 1 |
| 31.72 | 1 |
| 31.73 | 1 |
| 31.74 | 1 |
| 31.75 | 1 |
| 31.76 | 1 |
| 31.77 | 1 |
| 31.78 | 1 |
| 31.79 | 1 |
| 31.8 | 1 |
| 31.81 | 1 |
| 31.82 | 1 |
| 31.83 | 1 |
| 31.84 | 1 |
| 31.85 | 1 |
| 31.86 | 1 |
| 31.87 | 1 |
| 31.88 | 1 |
| 31.89 | 1 |
| 31.9 | 1 |
| 31.91 | 1 |
| 31.92 | 1 |
| 31.93 | 1 |
| 31.94 | 1 |
| 31.95 | 1 |
| 31.96 | 1 |
| 31.97 | 1 |
| 31.98 | 1 |
| 31.99 | 1 |
| 32.0 | 1 |
| 32.01 | 1 |
| 32.02 | 1 |
| 32.03 | 1 |
| 32.04 | 1 |
| 32.05 | 1 |
| 32.06 | 1 |
| 32.07 | 1 |
| 32.08 | 1 |
| 32.09 | 1 |
| 32.1 | 1 |
| 32.11 | 1 |
| 32.12 | 1 |
| 32.13 | 1 |
| 32.14 | 1 |
| 32.15 | 1 |
| 32.16 | 1 |
| 32.17 | 1 |
| 32.18 | 1 |
| 32.19 | 1 |
| 32.2 | 1 |
| 32.21 | 1 |
| 32.22 | 1 |
| 32.23 | 1 |
| 32.24 | 1 |
| 32.25 | 1 |
| 32.26 | 1 |
| 32.27 | 1 |
| 32.28 | 1 |
| 32.29 | 1 |
| 32.3 | 1 |
| 32.31 | 1 |
| 32.32 | 1 |
| 32.33 | 1 |
| 32.34 | 1 |
| 32.35 | 1 |
| 32.36 | 1 |
| 32.37 | 1 |
| 32.38 | 1 |
| 32.39 | 1 |
| 32.4 | 1 |
| 32.41 | 1 |
| 32.42 | 1 |
| 32.43 | 1 |
| 32.44 | 1 |
| 32.45 | 1 |
| 32.46 | 1 |
| 32.47 | 1 |
| 32.48 | 1 |
| 32.49 | 1 |
| 32.5 | 1 |
| 32.51 | 1 |
| 32.52 | 1 |
| 32.53 | 1 |
| 32.54 | 1 |
| 32.55 | 1 |
| 32.56 | 1 |
| 32.57 | 1 |
| 32.58 | 1 |
| 32.59 | 1 |
| 32.6 | 1 |
| 32.61 | 1 |
| 32.62 | 1 |
| 32.63 | 1 |
| 32.64 | 1 |
| 32.65 | 1 |
| 32.66 | 1 |
| 32.67 | 1 |
| 32.68 | 1 |
| 32.69 | 1 |
| 32.7 | 1 |
| 32.71 | 1 |
| 32.72 | 1 |
| 32.73 | 1 |
| 32.74 | 1 |
| 32.75 | 1 |
| 32.76 | 1 |
| 32.77 | 1 |
| 32.78 | 1 |
| 32.79 | 1 |
| 32.8 | 1 |
| 32.81 | 1 |
| 32.82 | 1 |
| 32.83 | 1 |
| 32.84 | 1 |
| 32.85 | 1 |
| 32.86 | 1 |
| 32.87 | 1 |
| 32.88 | 1 |
| 32.89 | 1 |
| 32.9 | 1 |
| 32.91 | 1 |
| 32.92 | 1 |
| 32.93 | 1 |
| 32.94 | 1 |
| 32.95 | 1 |
| 32.96 | 1 |
| 32.97 | 1 |
| 32.98 | 1 |
| 32.99 | 1 |
| 33.0 | 1 |
| 33.01 | 1 |
| 33.02 | 1 |
| 33.03 | 1 |
| 33.04 | 1 |
| 33.05 | 1 |
| 33.06 | 1 |
| 33.07 | 1 |
| 33.08 | 1 |
| 33.09 | 1 |
| 33.1 | 1 |
| 33.11 | 1 |
| 33.12 | 1 |
| 33.13 | 1 |
| 33.14 | 1 |
| 33.15 | 1 |
| 33.16 | 1 |
| 33.17 | 1 |
| 33.18 | 1 |
| 33.19 | 1 |
| 33.2 | 1 |
| 33.21 | 1 |
| 33.22 | 1 |
| 33.23 | 1 |
| 33.24 | 1 |
| 33.25 | 1 |
| 33.26 | 1 |
| 33.27 | 1 |
| 33.28 | 1 |
| 33.29 | 1 |
| 33.3 | 1 |
| 33.31 | 1 |
| 33.32 | 1 |
| 33.33 | 1 |
| 33.34 | 1 |
| 33.35 | 1 |
| 33.36 | 1 |
| 33.37 | 1 |
| 33.38 | 1 |
| 33.39 | 1 |
| 33.4 | 1 |
| 33.41 | 1 |
| 33.42 | 1 |
| 33.43 | 1 |
| 33.44 | 1 |
| 33.45 | 1 |
| 33.46 | 1 |
| 33.47 | 1 |
| 33.48 | 1 |
| 33.49 | 1 |
| 33.5 | 1 |
| 33.51 | 1 |
| 33.52 | 1 |
| 33.53 | 1 |
| 33.54 | 1 |
| 33.55 | 1 |
| 33.56 | 1 |
| 33.57 | 1 |
| 33.58 | 1 |
| 33.59 | 1 |
| 33.6 | 1 |
| 33.61 | 1 |
| 33.62 | 1 |
| 33.63 | 1 |
| 33.64 | 1 |
| 33.65 | 1 |
| 33.66 | 1 |
| 33.67 | 1 |
| 33.68 | 1 |
| 33.69 | 1 |
| 33.7 | 1 |
| 33.71 | 1 |
| 33.72 | 1 |
| 33.73 | 1 |
| 33.74 | 1 |
| 33.75 | 1 |
| 33.76 | 1 |
| 33.77 | 1 |
| 33.78 | 1 |
| 33.79 | 1 |
| 33.8 | 1 |
| 33.81 | 1 |
| 33.82 | 1 |
| 33.83 | 1 |
| 33.84 | 1 |
| 33.85 | 1 |
| 33.86 | 1 |
| 33.87 | 1 |
| 33.88 | 1 |
| 33.89 | 1 |
| 33.9 | 1 |
| 33.91 | 1 |
| 33.92 | 1 |
| 33.93 | 1 |
| 33.94 | 1 |
| 33.95 | 1 |
| 33.96 | 1 |
| 33.97 | 1 |
| 33.98 | 1 |
| 33.99 | 1 |
| 34.0 | 1 |
| 34.01 | 1 |
| 34.02 | 1 |
| 34.03 | 1 |
| 34.04 | 1 |
| 34.05 | 1 |
| 34.06 | 1 |
| 34.07 | 1 |
| 34.08 | 1 |
| 34.09 | 1 |
| 34.1 | 1 |
| 34.11 | 1 |
| 34.12 | 1 |
| 34.13 | 1 |
| 34.14 | 1 |
| 34.15 | 1 |
| 34.16 | 1 |
| 34.17 | 1 |
| 34.18 | 1 |
| 34.19 | 1 |
| 34.2 | 1 |
| 34.21 | 1 |
| 34.22 | 1 |
| 34.23 | 1 |
| 34.24 | 1 |
| 34.25 | 1 |
| 34.26 | 1 |
| 34.27 | 1 |
| 34.28 | 1 |
| 34.29 | 1 |
| 34.3 | 1 |
| 34.31 | 1 |
| 34.32 | 1 |
| 34.33 | 1 |
| 34.34 | 1 |
| 34.35 | 1 |
| 34.36 | 1 |
| 34.37 | 1 |
| 34.38 | 1 |
| 34.39 | 1 |
| 34.4 | 1 |
| 34.41 | 1 |
| 34.42 | 1 |
| 34.43 | 1 |
| 34.44 | 1 |
| 34.45 | 1 |
| 34.46 | 1 |
| 34.47 | 1 |
| 34.48 | 1 |
| 34.49 | 1 |
| 34.5 | 1 |
| 34.51 | 1 |
| 34.52 | 1 |
| 34.53 | 1 |
| 34.54 | 1 |
| 34.55 | 1 |
| 34.56 | 1 |
| 34.57 | 1 |
| 34.58 | 1 |
| 34.59 | 1 |
| 34.6 | 1 |
| 34.61 | 1 |
| 34.62 | 1 |
| 34.63 | 1 |
| 34.64 | 1 |
| 34.65 | 1 |
| 34.66 | 1 |
| 34.67 | 1 |
| 34.68 | 1 |
| 34.69 | 1 |
| 34.7 | 1 |
| 34.71 | 1 |
| 34.72 | 1 |
| 34.73 | 1 |
| 34.74 | 1 |
| 34.75 | 1 |
| 34.76 | 1 |
| 34.77 | 1 |
| 34.78 | 1 |
| 34.79 | 1 |
| 34.8 | 1 |
| 34.81 | 1 |
| 34.82 | 1 |
| 34.83 | 1 |
| 34.84 | 1 |
| 34.85 | 1 |
| 34.86 | 1 |
| 34.87 | 1 |
| 34.88 | 1 |
| 34.89 | 1 |
| 34.9 | 1 |
| 34.91 | 1 |
| 34.92 | 1 |
| 34.93 | 1 |
| 34.94 | 1 |
| 34.95 | 1 |
| 34.96 | 1 |
| 34.97 | 1 |
| 34.98 | 1 |
| 34.99 | 1 |
| 35.0 | 1 |
| 35.01 | 1 |
| 35.02 | 1 |
| 35.03 | 1 |
| 35.04 | 1 |
| 35.05 | 1 |
| 35.06 | 1 |
| 35.07 | 1 |
| 35.08 | 1 |
| 35.09 | 1 |
| 35.1 | 1 |
| 35.11 | 1 |
| 35.12 | 1 |
| 35.13 | 1 |
| 35.14 | 1 |
| 35.15 | 1 |
| 35.16 | 1 |
| 35.17 | 1 |
| 35.18 | 1 |
| 35.19 | 1 |
| 35.2 | 1 |
| 35.21 | 1 |
| 35.22 | 1 |
| 35.23 | 1 |
| 35.24 | 1 |
| 35.25 | 1 |
| 35.26 | 1 |
| 35.27 | 1 |
| 35.28 | 1 |
| 35.29 | 1 |
| 35.3 | 1 |
| 35.31 | 1 |
| 35.32 | 1 |
| 35.33 | 1 |
| 35.34 | 1 |
| 35.35 | 1 |
| 35.36 | 1 |
| 35.37 | 1 |
| 35.38 | 1 |
| 35.39 | 1 |
| 35.4 | 1 |
| 35.41 | 1 |
| 35.42 | 1 |
| 35.43 | 1 |
| 35.44 | 1 |
| 35.45 | 1 |
| 35.46 | 1 |
| 35.47 | 1 |
| 35.48 | 1 |
| 35.49 | 1 |
| 35.5 | 1 |
| 35.51 | 1 |
| 35.52 | 1 |
| 35.53 | 1 |
| 35.54 | 1 |
| 35.55 | 1 |
| 35.56 | 1 |
| 35.57 | 1 |
| 35.58 | 1 |
| 35.59 | 1 |
| 35.6 | 1 |
| 35.61 | 1 |
| 35.62 | 1 |
| 35.63 | 1 |
| 35.64 | 1 |
| 35.65 | 1 |
| 35.66 | 1 |
| 35.67 | 1 |
| 35.68 | 1 |
| 35.69 | 1 |
| 35.7 | 1 |
| 35.71 | 1 |
| 35.72 | 1 |
| 35.73 | 1 |
| 35.74 | 1 |
| 35.75 | 1 |
| 35.76 | 1 |
| 35.77 | 1 |
| 35.78 | 1 |
| 35.79 | 1 |
| 35.8 | 1 |
| 35.81 | 1 |
| 35.82 | 1 |
| 35.83 | 1 |
| 35.84 | 1 |
| 35.85 | 1 |
| 35.86 | 1 |
| 35.87 | 1 |
| 35.88 | 1 |
| 35.89 | 1 |
| 35.9 | 1 |
| 35.91 | 1 |
| 35.92 | 1 |
| 35.93 | 1 |
| 35.94 | 1 |
| 35.95 | 1 |
| 35.96 | 1 |
| 35.97 | 1 |
| 35.98 | 1 |
| 35.99 | 1 |
| 36.0 | 1 |
| 36.01 | 1 |
| 36.02 | 1 |
| 36.03 | 1 |
| 36.04 | 1 |
| 36.05 | 1 |
| 36.06 | 1 |
| 36.07 | 1 |
| 36.08 | 1 |
| 36.09 | 1 |
| 36.1 | 1 |
| 36.11 | 1 |
| 36.12 | 1 |
| 36.13 | 1 |
| 36.14 | 1 |
| 36.15 | 1 |
| 36.16 | 1 |
| 36.17 | 1 |
| 36.18 | 1 |
| 36.19 | 1 |
| 36.2 | 1 |
| 36.21 | 1 |
| 36.22 | 1 |
| 36.23 | 1 |
| 36.24 | 1 |
| 36.25 | 1 |
| 36.26 | 1 |
| 36.27 | 1 |
| 36.28 | 1 |
| 36.29 | 1 |
| 36.3 | 1 |
| 36.31 | 1 |
| 36.32 | 1 |
| 36.33 | 1 |
| 36.34 | 1 |
| 36.35 | 1 |
| 36.36 | 1 |
| 36.37 | 1 |
| 36.38 | 1 |
| 36.39 | 1 |
| 36.4 | 1 |
| 36.41 | 1 |
| 36.42 | 1 |
| 36.43 | 1 |
| 36.44 | 1 |
| 36.45 | 1 |
| 36.46 | 1 |
| 36.47 | 1 |
| 36.48 | 1 |
| 36.49 | 1 |
| 36.5 | 1 |
| 36.51 | 1 |
| 36.52 | 1 |
| 36.53 | 1 |
| 36.54 | 1 |
| 36.55 | 1 |
| 36.56 | 1 |
| 36.57 | 1 |
| 36.58 | 1 |
| 36.59 | 1 |
| 36.6 | 1 |
| 36.61 | 1 |
| 36.62 | 1 |
| 36.63 | 1 |
| 36.64 | 1 |
| 36.65 | 1 |
| 36.66 | 1 |
| 36.67 | 1 |
| 36.68 | 1 |
| 36.69 | 1 |
| 36.7 | 1 |
| 36.71 | 1 |
| 36.72 | 1 |
| 36.73 | 1 |
| 36.74 | 1 |
| 36.75 | 1 |
| 36.76 | 1 |
| 36.77 | 1 |
| 36.78 | 1 |
| 36.79 | 1 |
| 36.8 | 1 |
| 36.81 | 1 |
| 36.82 | 1 |
| 36.83 | 1 |
| 36.84 | 1 |
| 36.85 | 1 |
| 36.86 | 1 |
| 36.87 | 1 |
| 36.88 | 1 |
| 36.89 | 1 |
| 36.9 | 1 |
| 36.91 | 1 |
| 36.92 | 1 |
| 36.93 | 1 |
| 36.94 | 1 |
| 36.95 | 1 |
| 36.96 | 1 |
| 36.97 | 1 |
| 36.98 | 1 |
| 36.99 | 1 |
| 37.0 | 1 |
| 37.01 | 1 |
| 37.02 | 1 |
| 37.03 | 1 |
| 37.04 | 1 |
| 37.05 | 1 |
| 37.06 | 1 |
| 37.07 | 1 |
| 37.08 | 1 |
| 37.09 | 1 |
| 37.1 | 1 |
| 37.11 | 1 |
| 37.12 | 1 |
| 37.13 | 1 |
| 37.14 | 1 |
| 37.15 | 1 |
| 37.16 | 1 |
| 37.17 | 1 |
| 37.18 | 1 |
| 37.19 | 1 |
| 37.2 | 1 |
| 37.21 | 1 |
| 37.22 | 1 |
| 37.23 | 1 |
| 37.24 | 1 |
| 37.25 | 1 |
| 37.26 | 1 |
| 37.27 | 1 |
| 37.28 | 1 |
| 37.29 | 1 |
| 37.3 | 1 |
| 37.31 | 1 |
| 37.32 | 1 |
| 37.33 | 1 |
| 37.34 | 1 |
| 37.35 | 1 |
| 37.36 | 1 |
| 37.37 | 1 |
| 37.38 | 1 |
| 37.39 | 1 |
| 37.4 | 1 |
| 37.41 | 1 |
| 37.42 | 1 |
| 37.43 | 1 |
| 37.44 | 1 |
| 37.45 | 1 |
| 37.46 | 1 |
| 37.47 | 1 |
| 37.48 | 1 |
| 37.49 | 1 |
| 37.5 | 1 |
| 37.51 | 1 |
| 37.52 | 1 |
| 37.53 | 1 |
| 37.54 | 1 |
| 37.55 | 1 |
| 37.56 | 1 |
| 37.57 | 1 |
| 37.58 | 1 |
| 37.59 | 1 |
| 37.6 | 1 |
| 37.61 | 1 |
| 37.62 | 1 |
| 37.63 | 1 |
| 37.64 | 1 |
| 37.65 | 1 |
| 37.66 | 1 |
| 37.67 | 1 |
| 37.68 | 1 |
| 37.69 | 1 |
| 37.7 | 1 |
| 37.71 | 1 |
| 37.72 | 1 |
| 37.73 | 1 |
| 37.74 | 1 |
| 37.75 | 1 |
| 37.76 | 1 |
| 37.77 | 1 |
| 37.78 | 1 |
| 37.79 | 1 |
| 37.8 | 1 |
| 37.81 | 1 |
| 37.82 | 1 |
| 37.83 | 1 |
| 37.84 | 1 |
| 37.85 | 1 |
| 37.86 | 1 |
| 37.87 | 1 |
| 37.88 | 1 |
| 37.89 | 1 |
| 37.9 | 1 |
| 37.91 | 1 |
| 37.92 | 1 |
| 37.93 | 1 |
| 37.94 | 1 |
| 37.95 | 1 |
| 37.96 | 1 |
| 37.97 | 1 |
| 37.98 | 1 |
| 37.99 | 1 |
| 38.0 | 1 |
| 38.01 | 1 |
| 38.02 | 1 |
| 38.03 | 1 |
| 38.04 | 1 |
| 38.05 | 1 |
| 38.06 | 1 |
| 38.07 | 1 |
| 38.08 | 1 |
| 38.09 | 1 |
| 38.1 | 1 |
| 38.11 | 1 |
| 38.12 | 1 |
| 38.13 | 1 |
| 38.14 | 1 |
| 38.15 | 1 |
| 38.16 | 1 |
| 38.17 | 1 |
| 38.18 | 1 |
| 38.19 | 1 |
| 38.2 | 1 |
| 38.21 | 1 |
| 38.22 | 1 |
| 38.23 | 1 |
| 38.24 | 1 |
| 38.25 | 1 |
| 38.26 | 1 |
| 38.27 | 1 |
| 38.28 | 1 |
| 38.29 | 1 |
| 38.3 | 1 |
| 38.31 | 1 |
| 38.32 | 1 |
| 38.33 | 1 |
| 38.34 | 1 |
| 38.35 | 1 |
| 38.36 | 1 |
| 38.37 | 1 |
| 38.38 | 1 |
| 38.39 | 1 |
| 38.4 | 1 |
| 38.41 | 1 |
| 38.42 | 1 |
| 38.43 | 1 |
| 38.44 | 1 |
| 38.45 | 1 |
| 38.46 | 1 |
| 38.47 | 1 |
| 38.48 | 1 |
| 38.49 | 1 |
| 38.5 | 1 |
| 38.51 | 1 |
| 38.52 | 1 |
| 38.53 | 1 |
| 38.54 | 1 |
| 38.55 | 1 |
| 38.56 | 1 |
| 38.57 | 1 |
| 38.58 | 1 |
| 38.59 | 1 |
| 38.6 | 1 |
| 38.61 | 1 |
| 38.62 | 1 |
| 38.63 | 1 |
| 38.64 | 1 |
| 38.65 | 1 |
| 38.66 | 1 |
| 38.67 | 1 |
| 38.68 | 1 |
| 38.69 | 1 |
| 38.7 | 1 |
| 38.71 | 1 |
| 38.72 | 1 |
| 38.73 | 1 |
| 38.74 | 1 |
| 38.75 | 1 |
| 38.76 | 1 |
| 38.77 | 1 |
| 38.78 | 1 |
| 38.79 | 1 |
| 38.8 | 1 |
| 38.81 | 1 |
| 38.82 | 1 |
| 38.83 | 1 |
| 38.84 | 1 |
| 38.85 | 1 |
| 38.86 | 1 |
| 38.87 | 1 |
| 38.88 | 1 |
| 38.89 | 1 |
| 38.9 | 1 |
| 38.91 | 1 |
| 38.92 | 1 |
| 38.93 | 1 |
| 38.94 | 1 |
| 38.95 | 1 |
| 38.96 | 1 |
| 38.97 | 1 |
| 38.98 | 1 |
| 38.99 | 1 |
| 39.0 | 1 |
| 39.01 | 1 |
| 39.02 | 1 |
| 39.03 | 1 |
| 39.04 | 1 |
| 39.05 | 1 |
| 39.06 | 1 |
| 39.07 | 1 |
| 39.08 | 1 |
| 39.09 | 1 |
| 39.1 | 1 |
| 39.11 | 1 |
| 39.12 | 1 |
| 39.13 | 1 |
| 39.14 | 1 |
| 39.15 | 1 |
| 39.16 | 1 |
| 39.17 | 1 |
| 39.18 | 1 |
| 39.19 | 1 |
| 39.2 | 1 |
| 39.21 | 1 |
| 39.22 | 1 |
| 39.23 | 1 |
| 39.24 | 1 |
| 39.25 | 1 |
| 39.26 | 1 |
| 39.27 | 1 |
| 39.28 | 1 |
| 39.29 | 1 |
| 39.3 | 1 |
| 39.31 | 1 |
| 39.32 | 1 |
| 39.33 | 1 |
| 39.34 | 1 |
| 39.35 | 1 |
| 39.36 | 1 |
| 39.37 | 1 |
| 39.38 | 1 |
| 39.39 | 1 |
| 39.4 | 1 |
| 39.41 | 1 |
| 39.42 | 1 |
| 39.43 | 1 |
| 39.44 | 1 |
| 39.45 | 1 |
| 39.46 | 1 |
| 39.47 | 1 |
| 39.48 | 1 |
| 39.49 | 1 |
| 39.5 | 1 |
| 39.51 | 1 |
| 39.52 | 1 |
| 39.53 | 1 |
| 39.54 | 1 |
| 39.55 | 1 |
| 39.56 | 1 |
| 39.57 | 1 |
| 39.58 | 1 |
| 39.59 | 1 |
| 39.6 | 1 |
| 39.61 | 1 |
| 39.62 | 1 |
| 39.63 | 1 |
| 39.64 | 1 |
| 39.65 | 1 |
| 39.66 | 1 |
| 39.67 | 1 |
| 39.68 | 1 |
| 39.69 | 1 |
| 39.7 | 1 |
| 39.71 | 1 |
| 39.72 | 1 |
| 39.73 | 1 |
| 39.74 | 1 |
| 39.75 | 1 |
| 39.76 | 1 |
| 39.77 | 1 |
| 39.78 | 1 |
| 39.79 | 1 |
| 39.8 | 1 |
| 39.81 | 1 |
| 39.82 | 1 |
| 39.83 | 1 |
| 39.84 | 1 |
| 39.85 | 1 |
| 39.86 | 1 |
| 39.87 | 1 |
| 39.88 | 1 |
| 39.89 | 1 |
| 39.9 | 1 |
| 39.91 | 1 |
| 39.92 | 1 |
| 39.93 | 1 |
| 39.94 | 1 |
| 39.95 | 1 |
| 39.96 | 1 |
| 39.97 | 1 |
| 39.98 | 1 |
| 39.99 | 1 |
| 40.0 | 1 |
| 40.01 | 1 |
| 40.02 | 1 |
| 40.03 | 1 |
| 40.04 | 1 |
| 40.05 | 1 |
| 40.06 | 1 |
| 40.07 | 1 |
| 40.08 | 1 |
| 40.09 | 1 |
| 40.1 | 1 |
| 40.11 | 1 |
| 40.12 | 1 |
| 40.13 | 1 |
| 40.14 | 1 |
| 40.15 | 1 |
| 40.16 | 1 |
| 40.17 | 1 |
| 40.18 | 1 |
| 40.19 | 1 |
| 40.2 | 1 |
| 40.21 | 1 |
| 40.22 | 1 |
| 40.23 | 1 |
| 40.24 | 1 |
| 40.25 | 1 |
| 40.26 | 1 |
| 40.27 | 1 |
| 40.28 | 1 |
| 40.29 | 1 |
| 40.3 | 1 |
| 40.31 | 1 |
| 40.32 | 1 |
| 40.33 | 1 |
| 40.34 | 1 |
| 40.35 | 1 |
| 40.36 | 1 |
| 40.37 | 1 |
| 40.38 | 1 |
| 40.39 | 1 |
| 40.4 | 1 |
| 40.41 | 1 |
| 40.42 | 1 |
| 40.43 | 1 |
| 40.44 | 1 |
| 40.45 | 1 |
| 40.46 | 1 |
| 40.47 | 1 |
| 40.48 | 1 |
| 40.49 | 1 |
| 40.5 | 1 |
| 40.51 | 1 |
| 40.52 | 1 |
| 40.53 | 1 |
| 40.54 | 1 |
| 40.55 | 1 |
| 40.56 | 1 |
| 40.57 | 1 |
| 40.58 | 1 |
| 40.59 | 1 |
| 40.6 | 1 |
| 40.61 | 1 |
| 40.62 | 1 |
| 40.63 | 1 |
| 40.64 | 1 |
| 40.65 | 1 |
| 40.66 | 1 |
| 40.67 | 1 |
| 40.68 | 1 |
| 40.69 | 1 |
| 40.7 | 1 |
| 40.71 | 1 |
| 40.72 | 1 |
| 40.73 | 1 |
| 40.74 | 1 |
| 40.75 | 1 |
| 40.76 | 1 |
| 40.77 | 1 |
| 40.78 | 1 |
| 40.79 | 1 |
| 40.8 | 1 |
| 40.81 | 1 |
| 40.82 | 1 |
| 40.83 | 1 |
| 40.84 | 1 |
| 40.85 | 1 |
| 40.86 | 1 |
| 40.87 | 1 |
| 40.88 | 1 |
| 40.89 | 1 |
| 40.9 | 1 |
| 40.91 | 1 |
| 40.92 | 1 |
| 40.93 | 1 |
| 40.94 | 1 |
| 40.95 | 1 |